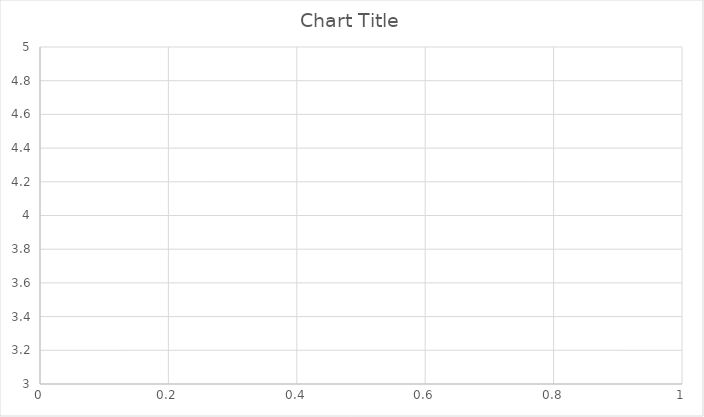
| Category | Series 0 |
|---|---|
| 0 | 3 |
| 1 | 4 |
| 2 | 4 |
| 3 | 3.75 |
| 4 | 3.8 |
| 5 | 3.833 |
| 6 | 3.857 |
| 7 | 3.75 |
| 8 | 3.778 |
| 9 | 3.8 |
| 10 | 3.818 |
| 11 | 3.917 |
| 12 | 4 |
| 13 | 3.929 |
| 14 | 3.933 |
| 15 | 3.875 |
| 16 | 3.941 |
| 17 | 4 |
| 18 | 3.947 |
| 19 | 3.9 |
| 20 | 3.905 |
| 21 | 3.909 |
| 22 | 3.87 |
| 23 | 3.875 |
| 24 | 3.88 |
| 25 | 3.923 |
| 26 | 3.926 |
| 27 | 3.929 |
| 28 | 3.931 |
| 29 | 3.9 |
| 30 | 3.903 |
| 31 | 3.906 |
| 32 | 3.909 |
| 33 | 3.941 |
| 34 | 3.914 |
| 35 | 3.917 |
| 36 | 3.919 |
| 37 | 3.895 |
| 38 | 3.872 |
| 39 | 3.9 |
| 40 | 3.902 |
| 41 | 3.881 |
| 42 | 3.86 |
| 43 | 3.886 |
| 44 | 3.889 |
| 45 | 3.87 |
| 46 | 3.872 |
| 47 | 3.875 |
| 48 | 3.857 |
| 49 | 3.88 |
| 50 | 3.882 |
| 51 | 3.885 |
| 52 | 3.887 |
| 53 | 3.87 |
| 54 | 3.855 |
| 55 | 3.857 |
| 56 | 3.86 |
| 57 | 3.845 |
| 58 | 3.864 |
| 59 | 3.85 |
| 60 | 3.836 |
| 61 | 3.839 |
| 62 | 3.857 |
| 63 | 3.844 |
| 64 | 3.862 |
| 65 | 3.848 |
| 66 | 3.851 |
| 67 | 3.838 |
| 68 | 3.841 |
| 69 | 3.843 |
| 70 | 3.859 |
| 71 | 3.875 |
| 72 | 3.863 |
| 73 | 3.865 |
| 74 | 3.88 |
| 75 | 3.882 |
| 76 | 3.883 |
| 77 | 3.872 |
| 78 | 3.861 |
| 79 | 3.875 |
| 80 | 3.864 |
| 81 | 3.854 |
| 82 | 3.843 |
| 83 | 3.845 |
| 84 | 3.835 |
| 85 | 3.826 |
| 86 | 3.828 |
| 87 | 3.841 |
| 88 | 3.854 |
| 89 | 3.856 |
| 90 | 3.846 |
| 91 | 3.859 |
| 92 | 3.871 |
| 93 | 3.862 |
| 94 | 3.853 |
| 95 | 3.854 |
| 96 | 3.845 |
| 97 | 3.837 |
| 98 | 3.838 |
| 99 | 3.84 |
| 100 | 3.842 |
| 101 | 3.833 |
| 102 | 3.825 |
| 103 | 3.817 |
| 104 | 3.81 |
| 105 | 3.802 |
| 106 | 3.804 |
| 107 | 3.806 |
| 108 | 3.798 |
| 109 | 3.791 |
| 110 | 3.793 |
| 111 | 3.786 |
| 112 | 3.788 |
| 113 | 3.781 |
| 114 | 3.774 |
| 115 | 3.767 |
| 116 | 3.769 |
| 117 | 3.763 |
| 118 | 3.756 |
| 119 | 3.758 |
| 120 | 3.752 |
| 121 | 3.746 |
| 122 | 3.748 |
| 123 | 3.758 |
| 124 | 3.768 |
| 125 | 3.77 |
| 126 | 3.772 |
| 127 | 3.773 |
| 128 | 3.775 |
| 129 | 3.785 |
| 130 | 3.779 |
| 131 | 3.78 |
| 132 | 3.782 |
| 133 | 3.776 |
| 134 | 3.77 |
| 135 | 3.765 |
| 136 | 3.766 |
| 137 | 3.768 |
| 138 | 3.777 |
| 139 | 3.779 |
| 140 | 3.773 |
| 141 | 3.768 |
| 142 | 3.762 |
| 143 | 3.771 |
| 144 | 3.766 |
| 145 | 3.774 |
| 146 | 3.769 |
| 147 | 3.764 |
| 148 | 3.765 |
| 149 | 3.76 |
| 150 | 3.755 |
| 151 | 3.757 |
| 152 | 3.752 |
| 153 | 3.747 |
| 154 | 3.748 |
| 155 | 3.756 |
| 156 | 3.758 |
| 157 | 3.759 |
| 158 | 3.755 |
| 159 | 3.756 |
| 160 | 3.758 |
| 161 | 3.759 |
| 162 | 3.755 |
| 163 | 3.756 |
| 164 | 3.758 |
| 165 | 3.753 |
| 166 | 3.749 |
| 167 | 3.75 |
| 168 | 3.746 |
| 169 | 3.741 |
| 170 | 3.749 |
| 171 | 3.75 |
| 172 | 3.746 |
| 173 | 3.747 |
| 174 | 3.754 |
| 175 | 3.756 |
| 176 | 3.751 |
| 177 | 3.753 |
| 178 | 3.749 |
| 179 | 3.744 |
| 180 | 3.746 |
| 181 | 3.742 |
| 182 | 3.738 |
| 183 | 3.734 |
| 184 | 3.73 |
| 185 | 3.731 |
| 186 | 3.733 |
| 187 | 3.734 |
| 188 | 3.73 |
| 189 | 3.737 |
| 190 | 3.738 |
| 191 | 3.734 |
| 192 | 3.741 |
| 193 | 3.742 |
| 194 | 3.738 |
| 195 | 3.735 |
| 196 | 3.736 |
| 197 | 3.737 |
| 198 | 3.739 |
| 199 | 3.74 |
| 200 | 3.741 |
| 201 | 3.748 |
| 202 | 3.754 |
| 203 | 3.75 |
| 204 | 3.751 |
| 205 | 3.748 |
| 206 | 3.754 |
| 207 | 3.76 |
| 208 | 3.756 |
| 209 | 3.757 |
| 210 | 3.754 |
| 211 | 3.759 |
| 212 | 3.761 |
| 213 | 3.757 |
| 214 | 3.753 |
| 215 | 3.755 |
| 216 | 3.756 |
| 217 | 3.752 |
| 218 | 3.749 |
| 219 | 3.745 |
| 220 | 3.747 |
| 221 | 3.752 |
| 222 | 3.749 |
| 223 | 3.754 |
| 224 | 3.751 |
| 225 | 3.748 |
| 226 | 3.753 |
| 227 | 3.754 |
| 228 | 3.751 |
| 229 | 3.752 |
| 230 | 3.758 |
| 231 | 3.754 |
| 232 | 3.755 |
| 233 | 3.756 |
| 234 | 3.757 |
| 235 | 3.754 |
| 236 | 3.755 |
| 237 | 3.752 |
| 238 | 3.753 |
| 239 | 3.754 |
| 240 | 3.751 |
| 241 | 3.748 |
| 242 | 3.745 |
| 243 | 3.746 |
| 244 | 3.747 |
| 245 | 3.752 |
| 246 | 3.749 |
| 247 | 3.75 |
| 248 | 3.747 |
| 249 | 3.748 |
| 250 | 3.753 |
| 251 | 3.758 |
| 252 | 3.763 |
| 253 | 3.76 |
| 254 | 3.757 |
| 255 | 3.754 |
| 256 | 3.751 |
| 257 | 3.756 |
| 258 | 3.761 |
| 259 | 3.758 |
| 260 | 3.759 |
| 261 | 3.763 |
| 262 | 3.764 |
| 263 | 3.761 |
| 264 | 3.762 |
| 265 | 3.759 |
| 266 | 3.76 |
| 267 | 3.761 |
| 268 | 3.762 |
| 269 | 3.759 |
| 270 | 3.756 |
| 271 | 3.757 |
| 272 | 3.758 |
| 273 | 3.755 |
| 274 | 3.76 |
| 275 | 3.761 |
| 276 | 3.758 |
| 277 | 3.763 |
| 278 | 3.76 |
| 279 | 3.757 |
| 280 | 3.762 |
| 281 | 3.759 |
| 282 | 3.76 |
| 283 | 3.757 |
| 284 | 3.754 |
| 285 | 3.755 |
| 286 | 3.753 |
| 287 | 3.75 |
| 288 | 3.747 |
| 289 | 3.748 |
| 290 | 3.749 |
| 291 | 3.753 |
| 292 | 3.754 |
| 293 | 3.755 |
| 294 | 3.756 |
| 295 | 3.753 |
| 296 | 3.751 |
| 297 | 3.748 |
| 298 | 3.746 |
| 299 | 3.743 |
| 300 | 3.748 |
| 301 | 3.748 |
| 302 | 3.752 |
| 303 | 3.753 |
| 304 | 3.754 |
| 305 | 3.752 |
| 306 | 3.752 |
| 307 | 3.753 |
| 308 | 3.751 |
| 309 | 3.752 |
| 310 | 3.756 |
| 311 | 3.76 |
| 312 | 3.757 |
| 313 | 3.755 |
| 314 | 3.752 |
| 315 | 3.75 |
| 316 | 3.754 |
| 317 | 3.758 |
| 318 | 3.759 |
| 319 | 3.759 |
| 320 | 3.76 |
| 321 | 3.761 |
| 322 | 3.759 |
| 323 | 3.759 |
| 324 | 3.757 |
| 325 | 3.758 |
| 326 | 3.758 |
| 327 | 3.759 |
| 328 | 3.757 |
| 329 | 3.755 |
| 330 | 3.755 |
| 331 | 3.756 |
| 332 | 3.757 |
| 333 | 3.757 |
| 334 | 3.755 |
| 335 | 3.756 |
| 336 | 3.754 |
| 337 | 3.757 |
| 338 | 3.761 |
| 339 | 3.762 |
| 340 | 3.762 |
| 341 | 3.766 |
| 342 | 3.77 |
| 343 | 3.767 |
| 344 | 3.768 |
| 345 | 3.769 |
| 346 | 3.767 |
| 347 | 3.764 |
| 348 | 3.765 |
| 349 | 3.766 |
| 350 | 3.766 |
| 351 | 3.764 |
| 352 | 3.762 |
| 353 | 3.76 |
| 354 | 3.761 |
| 355 | 3.761 |
| 356 | 3.759 |
| 357 | 3.763 |
| 358 | 3.76 |
| 359 | 3.764 |
| 360 | 3.765 |
| 361 | 3.762 |
| 362 | 3.76 |
| 363 | 3.764 |
| 364 | 3.764 |
| 365 | 3.762 |
| 366 | 3.763 |
| 367 | 3.764 |
| 368 | 3.767 |
| 369 | 3.765 |
| 370 | 3.765 |
| 371 | 3.763 |
| 372 | 3.761 |
| 373 | 3.762 |
| 374 | 3.765 |
| 375 | 3.763 |
| 376 | 3.764 |
| 377 | 3.765 |
| 378 | 3.763 |
| 379 | 3.766 |
| 380 | 3.766 |
| 381 | 3.77 |
| 382 | 3.768 |
| 383 | 3.768 |
| 384 | 3.771 |
| 385 | 3.772 |
| 386 | 3.77 |
| 387 | 3.768 |
| 388 | 3.769 |
| 389 | 3.767 |
| 390 | 3.767 |
| 391 | 3.77 |
| 392 | 3.774 |
| 393 | 3.772 |
| 394 | 3.77 |
| 395 | 3.768 |
| 396 | 3.766 |
| 397 | 3.766 |
| 398 | 3.767 |
| 399 | 3.768 |
| 400 | 3.766 |
| 401 | 3.766 |
| 402 | 3.767 |
| 403 | 3.765 |
| 404 | 3.768 |
| 405 | 3.766 |
| 406 | 3.769 |
| 407 | 3.77 |
| 408 | 3.773 |
| 409 | 3.776 |
| 410 | 3.774 |
| 411 | 3.774 |
| 412 | 3.775 |
| 413 | 3.775 |
| 414 | 3.776 |
| 415 | 3.774 |
| 416 | 3.772 |
| 417 | 3.773 |
| 418 | 3.776 |
| 419 | 3.779 |
| 420 | 3.781 |
| 421 | 3.78 |
| 422 | 3.778 |
| 423 | 3.781 |
| 424 | 3.779 |
| 425 | 3.777 |
| 426 | 3.775 |
| 427 | 3.778 |
| 428 | 3.776 |
| 429 | 3.777 |
| 430 | 3.78 |
| 431 | 3.778 |
| 432 | 3.778 |
| 433 | 3.781 |
| 434 | 3.782 |
| 435 | 3.782 |
| 436 | 3.785 |
| 437 | 3.783 |
| 438 | 3.781 |
| 439 | 3.78 |
| 440 | 3.78 |
| 441 | 3.778 |
| 442 | 3.779 |
| 443 | 3.777 |
| 444 | 3.775 |
| 445 | 3.776 |
| 446 | 3.776 |
| 447 | 3.775 |
| 448 | 3.775 |
| 449 | 3.773 |
| 450 | 3.774 |
| 451 | 3.774 |
| 452 | 3.773 |
| 453 | 3.775 |
| 454 | 3.776 |
| 455 | 3.776 |
| 456 | 3.775 |
| 457 | 3.773 |
| 458 | 3.776 |
| 459 | 3.774 |
| 460 | 3.772 |
| 461 | 3.773 |
| 462 | 3.771 |
| 463 | 3.772 |
| 464 | 3.772 |
| 465 | 3.773 |
| 466 | 3.775 |
| 467 | 3.776 |
| 468 | 3.776 |
| 469 | 3.777 |
| 470 | 3.775 |
| 471 | 3.773 |
| 472 | 3.772 |
| 473 | 3.77 |
| 474 | 3.771 |
| 475 | 3.771 |
| 476 | 3.769 |
| 477 | 3.768 |
| 478 | 3.768 |
| 479 | 3.767 |
| 480 | 3.765 |
| 481 | 3.766 |
| 482 | 3.764 |
| 483 | 3.762 |
| 484 | 3.763 |
| 485 | 3.761 |
| 486 | 3.762 |
| 487 | 3.764 |
| 488 | 3.765 |
| 489 | 3.767 |
| 490 | 3.77 |
| 491 | 3.768 |
| 492 | 3.771 |
| 493 | 3.769 |
| 494 | 3.768 |
| 495 | 3.768 |
| 496 | 3.771 |
| 497 | 3.769 |
| 498 | 3.77 |
| 499 | 3.772 |
| 500 | 3.77 |
| 501 | 3.771 |
| 502 | 3.773 |
| 503 | 3.772 |
| 504 | 3.772 |
| 505 | 3.773 |
| 506 | 3.771 |
| 507 | 3.77 |
| 508 | 3.768 |
| 509 | 3.769 |
| 510 | 3.767 |
| 511 | 3.768 |
| 512 | 3.766 |
| 513 | 3.765 |
| 514 | 3.765 |
| 515 | 3.766 |
| 516 | 3.768 |
| 517 | 3.768 |
| 518 | 3.767 |
| 519 | 3.765 |
| 520 | 3.766 |
| 521 | 3.764 |
| 522 | 3.765 |
| 523 | 3.763 |
| 524 | 3.766 |
| 525 | 3.764 |
| 526 | 3.765 |
| 527 | 3.765 |
| 528 | 3.766 |
| 529 | 3.764 |
| 530 | 3.763 |
| 531 | 3.765 |
| 532 | 3.767 |
| 533 | 3.768 |
| 534 | 3.766 |
| 535 | 3.767 |
| 536 | 3.767 |
| 537 | 3.766 |
| 538 | 3.766 |
| 539 | 3.769 |
| 540 | 3.767 |
| 541 | 3.768 |
| 542 | 3.768 |
| 543 | 3.77 |
| 544 | 3.771 |
| 545 | 3.771 |
| 546 | 3.771 |
| 547 | 3.774 |
| 548 | 3.776 |
| 549 | 3.776 |
| 550 | 3.777 |
| 551 | 3.775 |
| 552 | 3.774 |
| 553 | 3.774 |
| 554 | 3.773 |
| 555 | 3.773 |
| 556 | 3.774 |
| 557 | 3.772 |
| 558 | 3.773 |
| 559 | 3.775 |
| 560 | 3.775 |
| 561 | 3.774 |
| 562 | 3.773 |
| 563 | 3.775 |
| 564 | 3.773 |
| 565 | 3.774 |
| 566 | 3.774 |
| 567 | 3.773 |
| 568 | 3.772 |
| 569 | 3.77 |
| 570 | 3.771 |
| 571 | 3.773 |
| 572 | 3.773 |
| 573 | 3.772 |
| 574 | 3.774 |
| 575 | 3.776 |
| 576 | 3.776 |
| 577 | 3.775 |
| 578 | 3.774 |
| 579 | 3.772 |
| 580 | 3.771 |
| 581 | 3.77 |
| 582 | 3.77 |
| 583 | 3.771 |
| 584 | 3.769 |
| 585 | 3.77 |
| 586 | 3.772 |
| 587 | 3.77 |
| 588 | 3.772 |
| 589 | 3.771 |
| 590 | 3.772 |
| 591 | 3.774 |
| 592 | 3.774 |
| 593 | 3.774 |
| 594 | 3.775 |
| 595 | 3.775 |
| 596 | 3.774 |
| 597 | 3.773 |
| 598 | 3.773 |
| 599 | 3.772 |
| 600 | 3.77 |
| 601 | 3.771 |
| 602 | 3.769 |
| 603 | 3.772 |
| 604 | 3.772 |
| 605 | 3.772 |
| 606 | 3.773 |
| 607 | 3.771 |
| 608 | 3.772 |
| 609 | 3.77 |
| 610 | 3.771 |
| 611 | 3.77 |
| 612 | 3.768 |
| 613 | 3.77 |
| 614 | 3.772 |
| 615 | 3.773 |
| 616 | 3.775 |
| 617 | 3.775 |
| 618 | 3.775 |
| 619 | 3.777 |
| 620 | 3.778 |
| 621 | 3.777 |
| 622 | 3.777 |
| 623 | 3.776 |
| 624 | 3.774 |
| 625 | 3.776 |
| 626 | 3.775 |
| 627 | 3.775 |
| 628 | 3.776 |
| 629 | 3.776 |
| 630 | 3.777 |
| 631 | 3.775 |
| 632 | 3.776 |
| 633 | 3.778 |
| 634 | 3.78 |
| 635 | 3.781 |
| 636 | 3.782 |
| 637 | 3.781 |
| 638 | 3.779 |
| 639 | 3.781 |
| 640 | 3.78 |
| 641 | 3.78 |
| 642 | 3.781 |
| 643 | 3.78 |
| 644 | 3.78 |
| 645 | 3.779 |
| 646 | 3.779 |
| 647 | 3.779 |
| 648 | 3.781 |
| 649 | 3.78 |
| 650 | 3.782 |
| 651 | 3.784 |
| 652 | 3.783 |
| 653 | 3.784 |
| 654 | 3.785 |
| 655 | 3.784 |
| 656 | 3.785 |
| 657 | 3.786 |
| 658 | 3.785 |
| 659 | 3.783 |
| 660 | 3.782 |
| 661 | 3.781 |
| 662 | 3.781 |
| 663 | 3.783 |
| 664 | 3.783 |
| 665 | 3.785 |
| 666 | 3.787 |
| 667 | 3.786 |
| 668 | 3.786 |
| 669 | 3.785 |
| 670 | 3.784 |
| 671 | 3.783 |
| 672 | 3.783 |
| 673 | 3.785 |
| 674 | 3.784 |
| 675 | 3.783 |
| 676 | 3.783 |
| 677 | 3.785 |
| 678 | 3.785 |
| 679 | 3.784 |
| 680 | 3.784 |
| 681 | 3.783 |
| 682 | 3.783 |
| 683 | 3.785 |
| 684 | 3.784 |
| 685 | 3.784 |
| 686 | 3.783 |
| 687 | 3.782 |
| 688 | 3.782 |
| 689 | 3.781 |
| 690 | 3.781 |
| 691 | 3.782 |
| 692 | 3.781 |
| 693 | 3.78 |
| 694 | 3.78 |
| 695 | 3.779 |
| 696 | 3.779 |
| 697 | 3.778 |
| 698 | 3.78 |
| 699 | 3.779 |
| 700 | 3.777 |
| 701 | 3.778 |
| 702 | 3.777 |
| 703 | 3.777 |
| 704 | 3.777 |
| 705 | 3.778 |
| 706 | 3.778 |
| 707 | 3.778 |
| 708 | 3.779 |
| 709 | 3.777 |
| 710 | 3.778 |
| 711 | 3.777 |
| 712 | 3.777 |
| 713 | 3.777 |
| 714 | 3.776 |
| 715 | 3.777 |
| 716 | 3.775 |
| 717 | 3.776 |
| 718 | 3.776 |
| 719 | 3.776 |
| 720 | 3.775 |
| 721 | 3.774 |
| 722 | 3.773 |
| 723 | 3.772 |
| 724 | 3.772 |
| 725 | 3.771 |
| 726 | 3.772 |
| 727 | 3.771 |
| 728 | 3.77 |
| 729 | 3.771 |
| 730 | 3.77 |
| 731 | 3.77 |
| 732 | 3.771 |
| 733 | 3.771 |
| 734 | 3.77 |
| 735 | 3.769 |
| 736 | 3.769 |
| 737 | 3.768 |
| 738 | 3.769 |
| 739 | 3.768 |
| 740 | 3.769 |
| 741 | 3.768 |
| 742 | 3.767 |
| 743 | 3.766 |
| 744 | 3.768 |
| 745 | 3.767 |
| 746 | 3.766 |
| 747 | 3.767 |
| 748 | 3.766 |
| 749 | 3.768 |
| 750 | 3.768 |
| 751 | 3.77 |
| 752 | 3.77 |
| 753 | 3.769 |
| 754 | 3.77 |
| 755 | 3.771 |
| 756 | 3.771 |
| 757 | 3.773 |
| 758 | 3.772 |
| 759 | 3.774 |
| 760 | 3.774 |
| 761 | 3.776 |
| 762 | 3.775 |
| 763 | 3.774 |
| 764 | 3.773 |
| 765 | 3.772 |
| 766 | 3.771 |
| 767 | 3.77 |
| 768 | 3.769 |
| 769 | 3.769 |
| 770 | 3.77 |
| 771 | 3.769 |
| 772 | 3.77 |
| 773 | 3.77 |
| 774 | 3.769 |
| 775 | 3.768 |
| 776 | 3.768 |
| 777 | 3.77 |
| 778 | 3.77 |
| 779 | 3.772 |
| 780 | 3.772 |
| 781 | 3.774 |
| 782 | 3.773 |
| 783 | 3.773 |
| 784 | 3.775 |
| 785 | 3.776 |
| 786 | 3.778 |
| 787 | 3.778 |
| 788 | 3.778 |
| 789 | 3.778 |
| 790 | 3.779 |
| 791 | 3.779 |
| 792 | 3.781 |
| 793 | 3.781 |
| 794 | 3.781 |
| 795 | 3.783 |
| 796 | 3.782 |
| 797 | 3.783 |
| 798 | 3.785 |
| 799 | 3.784 |
| 800 | 3.783 |
| 801 | 3.783 |
| 802 | 3.782 |
| 803 | 3.782 |
| 804 | 3.781 |
| 805 | 3.782 |
| 806 | 3.781 |
| 807 | 3.781 |
| 808 | 3.781 |
| 809 | 3.781 |
| 810 | 3.781 |
| 811 | 3.78 |
| 812 | 3.78 |
| 813 | 3.779 |
| 814 | 3.779 |
| 815 | 3.778 |
| 816 | 3.778 |
| 817 | 3.778 |
| 818 | 3.778 |
| 819 | 3.778 |
| 820 | 3.778 |
| 821 | 3.777 |
| 822 | 3.776 |
| 823 | 3.775 |
| 824 | 3.776 |
| 825 | 3.776 |
| 826 | 3.775 |
| 827 | 3.774 |
| 828 | 3.776 |
| 829 | 3.775 |
| 830 | 3.774 |
| 831 | 3.773 |
| 832 | 3.772 |
| 833 | 3.771 |
| 834 | 3.771 |
| 835 | 3.772 |
| 836 | 3.772 |
| 837 | 3.772 |
| 838 | 3.771 |
| 839 | 3.771 |
| 840 | 3.772 |
| 841 | 3.772 |
| 842 | 3.771 |
| 843 | 3.77 |
| 844 | 3.769 |
| 845 | 3.771 |
| 846 | 3.77 |
| 847 | 3.771 |
| 848 | 3.771 |
| 849 | 3.772 |
| 850 | 3.771 |
| 851 | 3.771 |
| 852 | 3.77 |
| 853 | 3.77 |
| 854 | 3.77 |
| 855 | 3.77 |
| 856 | 3.769 |
| 857 | 3.769 |
| 858 | 3.768 |
| 859 | 3.769 |
| 860 | 3.77 |
| 861 | 3.769 |
| 862 | 3.768 |
| 863 | 3.769 |
| 864 | 3.769 |
| 865 | 3.768 |
| 866 | 3.767 |
| 867 | 3.766 |
| 868 | 3.768 |
| 869 | 3.768 |
| 870 | 3.769 |
| 871 | 3.771 |
| 872 | 3.77 |
| 873 | 3.771 |
| 874 | 3.771 |
| 875 | 3.771 |
| 876 | 3.77 |
| 877 | 3.77 |
| 878 | 3.77 |
| 879 | 3.77 |
| 880 | 3.771 |
| 881 | 3.771 |
| 882 | 3.772 |
| 883 | 3.773 |
| 884 | 3.773 |
| 885 | 3.773 |
| 886 | 3.772 |
| 887 | 3.773 |
| 888 | 3.774 |
| 889 | 3.773 |
| 890 | 3.772 |
| 891 | 3.771 |
| 892 | 3.772 |
| 893 | 3.772 |
| 894 | 3.772 |
| 895 | 3.772 |
| 896 | 3.773 |
| 897 | 3.774 |
| 898 | 3.774 |
| 899 | 3.773 |
| 900 | 3.772 |
| 901 | 3.773 |
| 902 | 3.772 |
| 903 | 3.772 |
| 904 | 3.772 |
| 905 | 3.773 |
| 906 | 3.773 |
| 907 | 3.773 |
| 908 | 3.772 |
| 909 | 3.771 |
| 910 | 3.773 |
| 911 | 3.772 |
| 912 | 3.771 |
| 913 | 3.771 |
| 914 | 3.772 |
| 915 | 3.771 |
| 916 | 3.772 |
| 917 | 3.772 |
| 918 | 3.773 |
| 919 | 3.773 |
| 920 | 3.772 |
| 921 | 3.772 |
| 922 | 3.772 |
| 923 | 3.772 |
| 924 | 3.772 |
| 925 | 3.771 |
| 926 | 3.77 |
| 927 | 3.772 |
| 928 | 3.772 |
| 929 | 3.771 |
| 930 | 3.77 |
| 931 | 3.77 |
| 932 | 3.77 |
| 933 | 3.769 |
| 934 | 3.77 |
| 935 | 3.771 |
| 936 | 3.771 |
| 937 | 3.771 |
| 938 | 3.772 |
| 939 | 3.771 |
| 940 | 3.772 |
| 941 | 3.772 |
| 942 | 3.772 |
| 943 | 3.771 |
| 944 | 3.771 |
| 945 | 3.772 |
| 946 | 3.771 |
| 947 | 3.77 |
| 948 | 3.769 |
| 949 | 3.769 |
| 950 | 3.769 |
| 951 | 3.768 |
| 952 | 3.769 |
| 953 | 3.768 |
| 954 | 3.768 |
| 955 | 3.767 |
| 956 | 3.766 |
| 957 | 3.766 |
| 958 | 3.766 |
| 959 | 3.766 |
| 960 | 3.766 |
| 961 | 3.766 |
| 962 | 3.767 |
| 963 | 3.769 |
| 964 | 3.768 |
| 965 | 3.768 |
| 966 | 3.769 |
| 967 | 3.771 |
| 968 | 3.771 |
| 969 | 3.771 |
| 970 | 3.772 |
| 971 | 3.772 |
| 972 | 3.772 |
| 973 | 3.773 |
| 974 | 3.772 |
| 975 | 3.772 |
| 976 | 3.772 |
| 977 | 3.772 |
| 978 | 3.772 |
| 979 | 3.773 |
| 980 | 3.775 |
| 981 | 3.775 |
| 982 | 3.776 |
| 983 | 3.777 |
| 984 | 3.779 |
| 985 | 3.779 |
| 986 | 3.779 |
| 987 | 3.778 |
| 988 | 3.778 |
| 989 | 3.779 |
| 990 | 3.78 |
| 991 | 3.781 |
| 992 | 3.78 |
| 993 | 3.78 |
| 994 | 3.781 |
| 995 | 3.78 |
| 996 | 3.779 |
| 997 | 3.78 |
| 998 | 3.78 |
| 999 | 3.781 |
| 1000 | 3.78 |
| 1001 | 3.78 |
| 1002 | 3.78 |
| 1003 | 3.78 |
| 1004 | 3.78 |
| 1005 | 3.78 |
| 1006 | 3.782 |
| 1007 | 3.781 |
| 1008 | 3.781 |
| 1009 | 3.782 |
| 1010 | 3.783 |
| 1011 | 3.784 |
| 1012 | 3.784 |
| 1013 | 3.784 |
| 1014 | 3.783 |
| 1015 | 3.784 |
| 1016 | 3.784 |
| 1017 | 3.783 |
| 1018 | 3.783 |
| 1019 | 3.784 |
| 1020 | 3.785 |
| 1021 | 3.784 |
| 1022 | 3.783 |
| 1023 | 3.782 |
| 1024 | 3.782 |
| 1025 | 3.782 |
| 1026 | 3.782 |
| 1027 | 3.782 |
| 1028 | 3.781 |
| 1029 | 3.782 |
| 1030 | 3.782 |
| 1031 | 3.781 |
| 1032 | 3.782 |
| 1033 | 3.782 |
| 1034 | 3.783 |
| 1035 | 3.783 |
| 1036 | 3.782 |
| 1037 | 3.783 |
| 1038 | 3.784 |
| 1039 | 3.785 |
| 1040 | 3.785 |
| 1041 | 3.784 |
| 1042 | 3.784 |
| 1043 | 3.784 |
| 1044 | 3.784 |
| 1045 | 3.785 |
| 1046 | 3.784 |
| 1047 | 3.785 |
| 1048 | 3.786 |
| 1049 | 3.787 |
| 1050 | 3.787 |
| 1051 | 3.787 |
| 1052 | 3.787 |
| 1053 | 3.788 |
| 1054 | 3.79 |
| 1055 | 3.79 |
| 1056 | 3.789 |
| 1057 | 3.789 |
| 1058 | 3.79 |
| 1059 | 3.79 |
| 1060 | 3.79 |
| 1061 | 3.789 |
| 1062 | 3.788 |
| 1063 | 3.788 |
| 1064 | 3.788 |
| 1065 | 3.787 |
| 1066 | 3.787 |
| 1067 | 3.787 |
| 1068 | 3.787 |
| 1069 | 3.787 |
| 1070 | 3.787 |
| 1071 | 3.788 |
| 1072 | 3.788 |
| 1073 | 3.787 |
| 1074 | 3.788 |
| 1075 | 3.789 |
| 1076 | 3.79 |
| 1077 | 3.79 |
| 1078 | 3.79 |
| 1079 | 3.789 |
| 1080 | 3.789 |
| 1081 | 3.79 |
| 1082 | 3.791 |
| 1083 | 3.791 |
| 1084 | 3.79 |
| 1085 | 3.79 |
| 1086 | 3.789 |
| 1087 | 3.789 |
| 1088 | 3.79 |
| 1089 | 3.789 |
| 1090 | 3.788 |
| 1091 | 3.788 |
| 1092 | 3.789 |
| 1093 | 3.789 |
| 1094 | 3.79 |
| 1095 | 3.791 |
| 1096 | 3.792 |
| 1097 | 3.793 |
| 1098 | 3.793 |
| 1099 | 3.792 |
| 1100 | 3.791 |
| 1101 | 3.791 |
| 1102 | 3.791 |
| 1103 | 3.792 |
| 1104 | 3.792 |
| 1105 | 3.792 |
| 1106 | 3.793 |
| 1107 | 3.793 |
| 1108 | 3.794 |
| 1109 | 3.793 |
| 1110 | 3.794 |
| 1111 | 3.794 |
| 1112 | 3.795 |
| 1113 | 3.794 |
| 1114 | 3.794 |
| 1115 | 3.793 |
| 1116 | 3.793 |
| 1117 | 3.794 |
| 1118 | 3.795 |
| 1119 | 3.796 |
| 1120 | 3.796 |
| 1121 | 3.796 |
| 1122 | 3.796 |
| 1123 | 3.796 |
| 1124 | 3.796 |
| 1125 | 3.796 |
| 1126 | 3.796 |
| 1127 | 3.796 |
| 1128 | 3.796 |
| 1129 | 3.796 |
| 1130 | 3.796 |
| 1131 | 3.795 |
| 1132 | 3.795 |
| 1133 | 3.795 |
| 1134 | 3.796 |
| 1135 | 3.795 |
| 1136 | 3.794 |
| 1137 | 3.794 |
| 1138 | 3.795 |
| 1139 | 3.795 |
| 1140 | 3.794 |
| 1141 | 3.794 |
| 1142 | 3.795 |
| 1143 | 3.795 |
| 1144 | 3.797 |
| 1145 | 3.797 |
| 1146 | 3.797 |
| 1147 | 3.796 |
| 1148 | 3.795 |
| 1149 | 3.795 |
| 1150 | 3.795 |
| 1151 | 3.796 |
| 1152 | 3.795 |
| 1153 | 3.795 |
| 1154 | 3.795 |
| 1155 | 3.795 |
| 1156 | 3.796 |
| 1157 | 3.795 |
| 1158 | 3.796 |
| 1159 | 3.796 |
| 1160 | 3.795 |
| 1161 | 3.795 |
| 1162 | 3.794 |
| 1163 | 3.794 |
| 1164 | 3.795 |
| 1165 | 3.795 |
| 1166 | 3.796 |
| 1167 | 3.797 |
| 1168 | 3.796 |
| 1169 | 3.796 |
| 1170 | 3.795 |
| 1171 | 3.794 |
| 1172 | 3.795 |
| 1173 | 3.796 |
| 1174 | 3.796 |
| 1175 | 3.796 |
| 1176 | 3.795 |
| 1177 | 3.795 |
| 1178 | 3.795 |
| 1179 | 3.794 |
| 1180 | 3.793 |
| 1181 | 3.794 |
| 1182 | 3.794 |
| 1183 | 3.794 |
| 1184 | 3.794 |
| 1185 | 3.793 |
| 1186 | 3.794 |
| 1187 | 3.795 |
| 1188 | 3.794 |
| 1189 | 3.795 |
| 1190 | 3.795 |
| 1191 | 3.794 |
| 1192 | 3.795 |
| 1193 | 3.796 |
| 1194 | 3.797 |
| 1195 | 3.797 |
| 1196 | 3.797 |
| 1197 | 3.796 |
| 1198 | 3.796 |
| 1199 | 3.795 |
| 1200 | 3.794 |
| 1201 | 3.794 |
| 1202 | 3.794 |
| 1203 | 3.793 |
| 1204 | 3.794 |
| 1205 | 3.794 |
| 1206 | 3.794 |
| 1207 | 3.793 |
| 1208 | 3.792 |
| 1209 | 3.792 |
| 1210 | 3.793 |
| 1211 | 3.793 |
| 1212 | 3.793 |
| 1213 | 3.792 |
| 1214 | 3.793 |
| 1215 | 3.793 |
| 1216 | 3.792 |
| 1217 | 3.793 |
| 1218 | 3.793 |
| 1219 | 3.793 |
| 1220 | 3.793 |
| 1221 | 3.794 |
| 1222 | 3.793 |
| 1223 | 3.792 |
| 1224 | 3.792 |
| 1225 | 3.793 |
| 1226 | 3.792 |
| 1227 | 3.793 |
| 1228 | 3.793 |
| 1229 | 3.793 |
| 1230 | 3.793 |
| 1231 | 3.794 |
| 1232 | 3.793 |
| 1233 | 3.793 |
| 1234 | 3.793 |
| 1235 | 3.792 |
| 1236 | 3.793 |
| 1237 | 3.794 |
| 1238 | 3.794 |
| 1239 | 3.794 |
| 1240 | 3.795 |
| 1241 | 3.794 |
| 1242 | 3.795 |
| 1243 | 3.795 |
| 1244 | 3.795 |
| 1245 | 3.795 |
| 1246 | 3.794 |
| 1247 | 3.793 |
| 1248 | 3.794 |
| 1249 | 3.794 |
| 1250 | 3.793 |
| 1251 | 3.793 |
| 1252 | 3.793 |
| 1253 | 3.793 |
| 1254 | 3.793 |
| 1255 | 3.792 |
| 1256 | 3.792 |
| 1257 | 3.792 |
| 1258 | 3.793 |
| 1259 | 3.792 |
| 1260 | 3.791 |
| 1261 | 3.792 |
| 1262 | 3.792 |
| 1263 | 3.791 |
| 1264 | 3.791 |
| 1265 | 3.79 |
| 1266 | 3.789 |
| 1267 | 3.79 |
| 1268 | 3.79 |
| 1269 | 3.79 |
| 1270 | 3.789 |
| 1271 | 3.79 |
| 1272 | 3.79 |
| 1273 | 3.79 |
| 1274 | 3.79 |
| 1275 | 3.79 |
| 1276 | 3.79 |
| 1277 | 3.79 |
| 1278 | 3.79 |
| 1279 | 3.789 |
| 1280 | 3.789 |
| 1281 | 3.789 |
| 1282 | 3.79 |
| 1283 | 3.79 |
| 1284 | 3.79 |
| 1285 | 3.789 |
| 1286 | 3.789 |
| 1287 | 3.79 |
| 1288 | 3.791 |
| 1289 | 3.791 |
| 1290 | 3.79 |
| 1291 | 3.791 |
| 1292 | 3.792 |
| 1293 | 3.793 |
| 1294 | 3.794 |
| 1295 | 3.794 |
| 1296 | 3.794 |
| 1297 | 3.794 |
| 1298 | 3.794 |
| 1299 | 3.794 |
| 1300 | 3.795 |
| 1301 | 3.794 |
| 1302 | 3.794 |
| 1303 | 3.793 |
| 1304 | 3.793 |
| 1305 | 3.792 |
| 1306 | 3.792 |
| 1307 | 3.791 |
| 1308 | 3.791 |
| 1309 | 3.792 |
| 1310 | 3.792 |
| 1311 | 3.792 |
| 1312 | 3.791 |
| 1313 | 3.791 |
| 1314 | 3.791 |
| 1315 | 3.792 |
| 1316 | 3.791 |
| 1317 | 3.791 |
| 1318 | 3.792 |
| 1319 | 3.792 |
| 1320 | 3.793 |
| 1321 | 3.794 |
| 1322 | 3.794 |
| 1323 | 3.793 |
| 1324 | 3.793 |
| 1325 | 3.793 |
| 1326 | 3.794 |
| 1327 | 3.794 |
| 1328 | 3.793 |
| 1329 | 3.792 |
| 1330 | 3.792 |
| 1331 | 3.793 |
| 1332 | 3.793 |
| 1333 | 3.793 |
| 1334 | 3.793 |
| 1335 | 3.794 |
| 1336 | 3.794 |
| 1337 | 3.794 |
| 1338 | 3.793 |
| 1339 | 3.794 |
| 1340 | 3.794 |
| 1341 | 3.794 |
| 1342 | 3.794 |
| 1343 | 3.795 |
| 1344 | 3.794 |
| 1345 | 3.794 |
| 1346 | 3.795 |
| 1347 | 3.795 |
| 1348 | 3.794 |
| 1349 | 3.795 |
| 1350 | 3.794 |
| 1351 | 3.794 |
| 1352 | 3.793 |
| 1353 | 3.793 |
| 1354 | 3.793 |
| 1355 | 3.794 |
| 1356 | 3.794 |
| 1357 | 3.795 |
| 1358 | 3.795 |
| 1359 | 3.796 |
| 1360 | 3.796 |
| 1361 | 3.797 |
| 1362 | 3.797 |
| 1363 | 3.797 |
| 1364 | 3.796 |
| 1365 | 3.797 |
| 1366 | 3.797 |
| 1367 | 3.797 |
| 1368 | 3.797 |
| 1369 | 3.796 |
| 1370 | 3.796 |
| 1371 | 3.795 |
| 1372 | 3.796 |
| 1373 | 3.797 |
| 1374 | 3.797 |
| 1375 | 3.797 |
| 1376 | 3.797 |
| 1377 | 3.796 |
| 1378 | 3.796 |
| 1379 | 3.796 |
| 1380 | 3.796 |
| 1381 | 3.795 |
| 1382 | 3.795 |
| 1383 | 3.794 |
| 1384 | 3.795 |
| 1385 | 3.796 |
| 1386 | 3.795 |
| 1387 | 3.795 |
| 1388 | 3.796 |
| 1389 | 3.796 |
| 1390 | 3.796 |
| 1391 | 3.796 |
| 1392 | 3.797 |
| 1393 | 3.796 |
| 1394 | 3.796 |
| 1395 | 3.796 |
| 1396 | 3.796 |
| 1397 | 3.796 |
| 1398 | 3.796 |
| 1399 | 3.796 |
| 1400 | 3.797 |
| 1401 | 3.797 |
| 1402 | 3.796 |
| 1403 | 3.796 |
| 1404 | 3.797 |
| 1405 | 3.798 |
| 1406 | 3.797 |
| 1407 | 3.797 |
| 1408 | 3.798 |
| 1409 | 3.797 |
| 1410 | 3.797 |
| 1411 | 3.797 |
| 1412 | 3.797 |
| 1413 | 3.797 |
| 1414 | 3.797 |
| 1415 | 3.797 |
| 1416 | 3.797 |
| 1417 | 3.797 |
| 1418 | 3.797 |
| 1419 | 3.798 |
| 1420 | 3.798 |
| 1421 | 3.798 |
| 1422 | 3.799 |
| 1423 | 3.799 |
| 1424 | 3.8 |
| 1425 | 3.801 |
| 1426 | 3.801 |
| 1427 | 3.801 |
| 1428 | 3.801 |
| 1429 | 3.801 |
| 1430 | 3.802 |
| 1431 | 3.802 |
| 1432 | 3.802 |
| 1433 | 3.803 |
| 1434 | 3.803 |
| 1435 | 3.804 |
| 1436 | 3.803 |
| 1437 | 3.804 |
| 1438 | 3.803 |
| 1439 | 3.803 |
| 1440 | 3.802 |
| 1441 | 3.802 |
| 1442 | 3.802 |
| 1443 | 3.802 |
| 1444 | 3.801 |
| 1445 | 3.801 |
| 1446 | 3.801 |
| 1447 | 3.8 |
| 1448 | 3.801 |
| 1449 | 3.801 |
| 1450 | 3.801 |
| 1451 | 3.801 |
| 1452 | 3.801 |
| 1453 | 3.801 |
| 1454 | 3.801 |
| 1455 | 3.8 |
| 1456 | 3.8 |
| 1457 | 3.8 |
| 1458 | 3.8 |
| 1459 | 3.801 |
| 1460 | 3.802 |
| 1461 | 3.801 |
| 1462 | 3.801 |
| 1463 | 3.801 |
| 1464 | 3.801 |
| 1465 | 3.802 |
| 1466 | 3.802 |
| 1467 | 3.802 |
| 1468 | 3.803 |
| 1469 | 3.802 |
| 1470 | 3.801 |
| 1471 | 3.801 |
| 1472 | 3.802 |
| 1473 | 3.801 |
| 1474 | 3.801 |
| 1475 | 3.8 |
| 1476 | 3.8 |
| 1477 | 3.8 |
| 1478 | 3.799 |
| 1479 | 3.799 |
| 1480 | 3.799 |
| 1481 | 3.798 |
| 1482 | 3.798 |
| 1483 | 3.797 |
| 1484 | 3.797 |
| 1485 | 3.797 |
| 1486 | 3.796 |
| 1487 | 3.796 |
| 1488 | 3.796 |
| 1489 | 3.796 |
| 1490 | 3.796 |
| 1491 | 3.796 |
| 1492 | 3.797 |
| 1493 | 3.797 |
| 1494 | 3.796 |
| 1495 | 3.795 |
| 1496 | 3.795 |
| 1497 | 3.795 |
| 1498 | 3.795 |
| 1499 | 3.795 |
| 1500 | 3.795 |
| 1501 | 3.794 |
| 1502 | 3.794 |
| 1503 | 3.794 |
| 1504 | 3.794 |
| 1505 | 3.794 |
| 1506 | 3.795 |
| 1507 | 3.795 |
| 1508 | 3.795 |
| 1509 | 3.795 |
| 1510 | 3.794 |
| 1511 | 3.795 |
| 1512 | 3.794 |
| 1513 | 3.794 |
| 1514 | 3.793 |
| 1515 | 3.793 |
| 1516 | 3.792 |
| 1517 | 3.792 |
| 1518 | 3.791 |
| 1519 | 3.791 |
| 1520 | 3.792 |
| 1521 | 3.791 |
| 1522 | 3.791 |
| 1523 | 3.792 |
| 1524 | 3.791 |
| 1525 | 3.792 |
| 1526 | 3.792 |
| 1527 | 3.792 |
| 1528 | 3.792 |
| 1529 | 3.792 |
| 1530 | 3.792 |
| 1531 | 3.792 |
| 1532 | 3.793 |
| 1533 | 3.793 |
| 1534 | 3.793 |
| 1535 | 3.794 |
| 1536 | 3.794 |
| 1537 | 3.794 |
| 1538 | 3.793 |
| 1539 | 3.794 |
| 1540 | 3.793 |
| 1541 | 3.792 |
| 1542 | 3.793 |
| 1543 | 3.793 |
| 1544 | 3.793 |
| 1545 | 3.792 |
| 1546 | 3.793 |
| 1547 | 3.793 |
| 1548 | 3.793 |
| 1549 | 3.794 |
| 1550 | 3.794 |
| 1551 | 3.795 |
| 1552 | 3.796 |
| 1553 | 3.795 |
| 1554 | 3.795 |
| 1555 | 3.795 |
| 1556 | 3.795 |
| 1557 | 3.796 |
| 1558 | 3.796 |
| 1559 | 3.796 |
| 1560 | 3.797 |
| 1561 | 3.798 |
| 1562 | 3.797 |
| 1563 | 3.798 |
| 1564 | 3.797 |
| 1565 | 3.798 |
| 1566 | 3.797 |
| 1567 | 3.797 |
| 1568 | 3.796 |
| 1569 | 3.796 |
| 1570 | 3.796 |
| 1571 | 3.795 |
| 1572 | 3.796 |
| 1573 | 3.797 |
| 1574 | 3.797 |
| 1575 | 3.798 |
| 1576 | 3.797 |
| 1577 | 3.797 |
| 1578 | 3.797 |
| 1579 | 3.797 |
| 1580 | 3.796 |
| 1581 | 3.796 |
| 1582 | 3.796 |
| 1583 | 3.797 |
| 1584 | 3.797 |
| 1585 | 3.796 |
| 1586 | 3.796 |
| 1587 | 3.796 |
| 1588 | 3.795 |
| 1589 | 3.795 |
| 1590 | 3.795 |
| 1591 | 3.795 |
| 1592 | 3.795 |
| 1593 | 3.794 |
| 1594 | 3.794 |
| 1595 | 3.794 |
| 1596 | 3.794 |
| 1597 | 3.794 |
| 1598 | 3.794 |
| 1599 | 3.793 |
| 1600 | 3.793 |
| 1601 | 3.794 |
| 1602 | 3.794 |
| 1603 | 3.794 |
| 1604 | 3.795 |
| 1605 | 3.795 |
| 1606 | 3.795 |
| 1607 | 3.795 |
| 1608 | 3.795 |
| 1609 | 3.794 |
| 1610 | 3.794 |
| 1611 | 3.794 |
| 1612 | 3.794 |
| 1613 | 3.793 |
| 1614 | 3.793 |
| 1615 | 3.793 |
| 1616 | 3.793 |
| 1617 | 3.793 |
| 1618 | 3.793 |
| 1619 | 3.793 |
| 1620 | 3.794 |
| 1621 | 3.794 |
| 1622 | 3.794 |
| 1623 | 3.794 |
| 1624 | 3.794 |
| 1625 | 3.795 |
| 1626 | 3.794 |
| 1627 | 3.794 |
| 1628 | 3.794 |
| 1629 | 3.794 |
| 1630 | 3.794 |
| 1631 | 3.794 |
| 1632 | 3.794 |
| 1633 | 3.794 |
| 1634 | 3.794 |
| 1635 | 3.794 |
| 1636 | 3.794 |
| 1637 | 3.794 |
| 1638 | 3.793 |
| 1639 | 3.793 |
| 1640 | 3.793 |
| 1641 | 3.793 |
| 1642 | 3.792 |
| 1643 | 3.793 |
| 1644 | 3.793 |
| 1645 | 3.793 |
| 1646 | 3.792 |
| 1647 | 3.793 |
| 1648 | 3.793 |
| 1649 | 3.793 |
| 1650 | 3.793 |
| 1651 | 3.792 |
| 1652 | 3.792 |
| 1653 | 3.793 |
| 1654 | 3.793 |
| 1655 | 3.793 |
| 1656 | 3.793 |
| 1657 | 3.793 |
| 1658 | 3.793 |
| 1659 | 3.793 |
| 1660 | 3.793 |
| 1661 | 3.793 |
| 1662 | 3.793 |
| 1663 | 3.793 |
| 1664 | 3.793 |
| 1665 | 3.792 |
| 1666 | 3.792 |
| 1667 | 3.793 |
| 1668 | 3.793 |
| 1669 | 3.792 |
| 1670 | 3.792 |
| 1671 | 3.792 |
| 1672 | 3.793 |
| 1673 | 3.793 |
| 1674 | 3.793 |
| 1675 | 3.792 |
| 1676 | 3.792 |
| 1677 | 3.793 |
| 1678 | 3.792 |
| 1679 | 3.792 |
| 1680 | 3.791 |
| 1681 | 3.791 |
| 1682 | 3.79 |
| 1683 | 3.791 |
| 1684 | 3.791 |
| 1685 | 3.791 |
| 1686 | 3.791 |
| 1687 | 3.79 |
| 1688 | 3.79 |
| 1689 | 3.791 |
| 1690 | 3.792 |
| 1691 | 3.791 |
| 1692 | 3.792 |
| 1693 | 3.792 |
| 1694 | 3.792 |
| 1695 | 3.791 |
| 1696 | 3.791 |
| 1697 | 3.791 |
| 1698 | 3.792 |
| 1699 | 3.792 |
| 1700 | 3.791 |
| 1701 | 3.792 |
| 1702 | 3.792 |
| 1703 | 3.792 |
| 1704 | 3.792 |
| 1705 | 3.792 |
| 1706 | 3.793 |
| 1707 | 3.793 |
| 1708 | 3.792 |
| 1709 | 3.792 |
| 1710 | 3.792 |
| 1711 | 3.791 |
| 1712 | 3.792 |
| 1713 | 3.792 |
| 1714 | 3.792 |
| 1715 | 3.793 |
| 1716 | 3.793 |
| 1717 | 3.793 |
| 1718 | 3.793 |
| 1719 | 3.793 |
| 1720 | 3.793 |
| 1721 | 3.793 |
| 1722 | 3.794 |
| 1723 | 3.795 |
| 1724 | 3.795 |
| 1725 | 3.794 |
| 1726 | 3.794 |
| 1727 | 3.795 |
| 1728 | 3.795 |
| 1729 | 3.794 |
| 1730 | 3.795 |
| 1731 | 3.796 |
| 1732 | 3.795 |
| 1733 | 3.795 |
| 1734 | 3.795 |
| 1735 | 3.794 |
| 1736 | 3.794 |
| 1737 | 3.795 |
| 1738 | 3.795 |
| 1739 | 3.795 |
| 1740 | 3.795 |
| 1741 | 3.795 |
| 1742 | 3.796 |
| 1743 | 3.796 |
| 1744 | 3.796 |
| 1745 | 3.796 |
| 1746 | 3.796 |
| 1747 | 3.796 |
| 1748 | 3.796 |
| 1749 | 3.796 |
| 1750 | 3.796 |
| 1751 | 3.796 |
| 1752 | 3.796 |
| 1753 | 3.796 |
| 1754 | 3.795 |
| 1755 | 3.796 |
| 1756 | 3.797 |
| 1757 | 3.797 |
| 1758 | 3.797 |
| 1759 | 3.797 |
| 1760 | 3.797 |
| 1761 | 3.797 |
| 1762 | 3.798 |
| 1763 | 3.798 |
| 1764 | 3.797 |
| 1765 | 3.797 |
| 1766 | 3.797 |
| 1767 | 3.797 |
| 1768 | 3.797 |
| 1769 | 3.797 |
| 1770 | 3.798 |
| 1771 | 3.797 |
| 1772 | 3.797 |
| 1773 | 3.797 |
| 1774 | 3.797 |
| 1775 | 3.797 |
| 1776 | 3.797 |
| 1777 | 3.798 |
| 1778 | 3.798 |
| 1779 | 3.798 |
| 1780 | 3.797 |
| 1781 | 3.797 |
| 1782 | 3.798 |
| 1783 | 3.798 |
| 1784 | 3.797 |
| 1785 | 3.797 |
| 1786 | 3.797 |
| 1787 | 3.798 |
| 1788 | 3.797 |
| 1789 | 3.797 |
| 1790 | 3.798 |
| 1791 | 3.798 |
| 1792 | 3.798 |
| 1793 | 3.798 |
| 1794 | 3.798 |
| 1795 | 3.797 |
| 1796 | 3.797 |
| 1797 | 3.798 |
| 1798 | 3.797 |
| 1799 | 3.797 |
| 1800 | 3.796 |
| 1801 | 3.796 |
| 1802 | 3.796 |
| 1803 | 3.796 |
| 1804 | 3.796 |
| 1805 | 3.796 |
| 1806 | 3.796 |
| 1807 | 3.796 |
| 1808 | 3.796 |
| 1809 | 3.796 |
| 1810 | 3.795 |
| 1811 | 3.796 |
| 1812 | 3.796 |
| 1813 | 3.795 |
| 1814 | 3.795 |
| 1815 | 3.795 |
| 1816 | 3.795 |
| 1817 | 3.795 |
| 1818 | 3.796 |
| 1819 | 3.797 |
| 1820 | 3.797 |
| 1821 | 3.797 |
| 1822 | 3.797 |
| 1823 | 3.797 |
| 1824 | 3.797 |
| 1825 | 3.797 |
| 1826 | 3.797 |
| 1827 | 3.797 |
| 1828 | 3.797 |
| 1829 | 3.796 |
| 1830 | 3.796 |
| 1831 | 3.796 |
| 1832 | 3.796 |
| 1833 | 3.796 |
| 1834 | 3.796 |
| 1835 | 3.796 |
| 1836 | 3.795 |
| 1837 | 3.795 |
| 1838 | 3.796 |
| 1839 | 3.795 |
| 1840 | 3.795 |
| 1841 | 3.795 |
| 1842 | 3.795 |
| 1843 | 3.795 |
| 1844 | 3.795 |
| 1845 | 3.795 |
| 1846 | 3.794 |
| 1847 | 3.795 |
| 1848 | 3.795 |
| 1849 | 3.795 |
| 1850 | 3.795 |
| 1851 | 3.796 |
| 1852 | 3.796 |
| 1853 | 3.796 |
| 1854 | 3.796 |
| 1855 | 3.796 |
| 1856 | 3.796 |
| 1857 | 3.795 |
| 1858 | 3.795 |
| 1859 | 3.795 |
| 1860 | 3.796 |
| 1861 | 3.795 |
| 1862 | 3.795 |
| 1863 | 3.795 |
| 1864 | 3.795 |
| 1865 | 3.795 |
| 1866 | 3.795 |
| 1867 | 3.794 |
| 1868 | 3.795 |
| 1869 | 3.795 |
| 1870 | 3.795 |
| 1871 | 3.795 |
| 1872 | 3.795 |
| 1873 | 3.796 |
| 1874 | 3.795 |
| 1875 | 3.795 |
| 1876 | 3.795 |
| 1877 | 3.794 |
| 1878 | 3.795 |
| 1879 | 3.795 |
| 1880 | 3.795 |
| 1881 | 3.794 |
| 1882 | 3.794 |
| 1883 | 3.795 |
| 1884 | 3.795 |
| 1885 | 3.794 |
| 1886 | 3.795 |
| 1887 | 3.795 |
| 1888 | 3.796 |
| 1889 | 3.795 |
| 1890 | 3.795 |
| 1891 | 3.795 |
| 1892 | 3.795 |
| 1893 | 3.796 |
| 1894 | 3.795 |
| 1895 | 3.795 |
| 1896 | 3.795 |
| 1897 | 3.796 |
| 1898 | 3.796 |
| 1899 | 3.795 |
| 1900 | 3.795 |
| 1901 | 3.795 |
| 1902 | 3.795 |
| 1903 | 3.796 |
| 1904 | 3.796 |
| 1905 | 3.796 |
| 1906 | 3.795 |
| 1907 | 3.795 |
| 1908 | 3.795 |
| 1909 | 3.794 |
| 1910 | 3.794 |
| 1911 | 3.794 |
| 1912 | 3.795 |
| 1913 | 3.794 |
| 1914 | 3.795 |
| 1915 | 3.794 |
| 1916 | 3.794 |
| 1917 | 3.795 |
| 1918 | 3.794 |
| 1919 | 3.794 |
| 1920 | 3.794 |
| 1921 | 3.794 |
| 1922 | 3.794 |
| 1923 | 3.794 |
| 1924 | 3.794 |
| 1925 | 3.794 |
| 1926 | 3.794 |
| 1927 | 3.795 |
| 1928 | 3.794 |
| 1929 | 3.795 |
| 1930 | 3.794 |
| 1931 | 3.795 |
| 1932 | 3.794 |
| 1933 | 3.794 |
| 1934 | 3.793 |
| 1935 | 3.793 |
| 1936 | 3.793 |
| 1937 | 3.793 |
| 1938 | 3.793 |
| 1939 | 3.792 |
| 1940 | 3.792 |
| 1941 | 3.793 |
| 1942 | 3.793 |
| 1943 | 3.792 |
| 1944 | 3.792 |
| 1945 | 3.791 |
| 1946 | 3.792 |
| 1947 | 3.792 |
| 1948 | 3.792 |
| 1949 | 3.791 |
| 1950 | 3.791 |
| 1951 | 3.791 |
| 1952 | 3.791 |
| 1953 | 3.79 |
| 1954 | 3.791 |
| 1955 | 3.79 |
| 1956 | 3.79 |
| 1957 | 3.791 |
| 1958 | 3.79 |
| 1959 | 3.79 |
| 1960 | 3.791 |
| 1961 | 3.791 |
| 1962 | 3.79 |
| 1963 | 3.79 |
| 1964 | 3.79 |
| 1965 | 3.79 |
| 1966 | 3.79 |
| 1967 | 3.79 |
| 1968 | 3.79 |
| 1969 | 3.791 |
| 1970 | 3.79 |
| 1971 | 3.791 |
| 1972 | 3.791 |
| 1973 | 3.791 |
| 1974 | 3.791 |
| 1975 | 3.791 |
| 1976 | 3.791 |
| 1977 | 3.791 |
| 1978 | 3.792 |
| 1979 | 3.792 |
| 1980 | 3.793 |
| 1981 | 3.793 |
| 1982 | 3.793 |
| 1983 | 3.793 |
| 1984 | 3.794 |
| 1985 | 3.794 |
| 1986 | 3.793 |
| 1987 | 3.794 |
| 1988 | 3.794 |
| 1989 | 3.793 |
| 1990 | 3.793 |
| 1991 | 3.794 |
| 1992 | 3.793 |
| 1993 | 3.793 |
| 1994 | 3.793 |
| 1995 | 3.794 |
| 1996 | 3.794 |
| 1997 | 3.794 |
| 1998 | 3.794 |
| 1999 | 3.794 |
| 2000 | 3.794 |
| 2001 | 3.794 |
| 2002 | 3.794 |
| 2003 | 3.794 |
| 2004 | 3.794 |
| 2005 | 3.794 |
| 2006 | 3.794 |
| 2007 | 3.793 |
| 2008 | 3.793 |
| 2009 | 3.793 |
| 2010 | 3.793 |
| 2011 | 3.793 |
| 2012 | 3.793 |
| 2013 | 3.793 |
| 2014 | 3.793 |
| 2015 | 3.793 |
| 2016 | 3.793 |
| 2017 | 3.793 |
| 2018 | 3.793 |
| 2019 | 3.794 |
| 2020 | 3.793 |
| 2021 | 3.793 |
| 2022 | 3.793 |
| 2023 | 3.792 |
| 2024 | 3.793 |
| 2025 | 3.793 |
| 2026 | 3.793 |
| 2027 | 3.793 |
| 2028 | 3.793 |
| 2029 | 3.792 |
| 2030 | 3.793 |
| 2031 | 3.793 |
| 2032 | 3.793 |
| 2033 | 3.794 |
| 2034 | 3.794 |
| 2035 | 3.794 |
| 2036 | 3.793 |
| 2037 | 3.793 |
| 2038 | 3.793 |
| 2039 | 3.794 |
| 2040 | 3.794 |
| 2041 | 3.794 |
| 2042 | 3.794 |
| 2043 | 3.795 |
| 2044 | 3.795 |
| 2045 | 3.795 |
| 2046 | 3.795 |
| 2047 | 3.795 |
| 2048 | 3.796 |
| 2049 | 3.796 |
| 2050 | 3.795 |
| 2051 | 3.795 |
| 2052 | 3.795 |
| 2053 | 3.795 |
| 2054 | 3.795 |
| 2055 | 3.795 |
| 2056 | 3.794 |
| 2057 | 3.794 |
| 2058 | 3.794 |
| 2059 | 3.794 |
| 2060 | 3.793 |
| 2061 | 3.793 |
| 2062 | 3.793 |
| 2063 | 3.793 |
| 2064 | 3.793 |
| 2065 | 3.793 |
| 2066 | 3.793 |
| 2067 | 3.793 |
| 2068 | 3.793 |
| 2069 | 3.793 |
| 2070 | 3.793 |
| 2071 | 3.793 |
| 2072 | 3.793 |
| 2073 | 3.792 |
| 2074 | 3.793 |
| 2075 | 3.793 |
| 2076 | 3.793 |
| 2077 | 3.793 |
| 2078 | 3.793 |
| 2079 | 3.793 |
| 2080 | 3.792 |
| 2081 | 3.793 |
| 2082 | 3.794 |
| 2083 | 3.793 |
| 2084 | 3.793 |
| 2085 | 3.793 |
| 2086 | 3.793 |
| 2087 | 3.794 |
| 2088 | 3.794 |
| 2089 | 3.793 |
| 2090 | 3.793 |
| 2091 | 3.793 |
| 2092 | 3.793 |
| 2093 | 3.793 |
| 2094 | 3.794 |
| 2095 | 3.794 |
| 2096 | 3.794 |
| 2097 | 3.794 |
| 2098 | 3.794 |
| 2099 | 3.794 |
| 2100 | 3.794 |
| 2101 | 3.794 |
| 2102 | 3.794 |
| 2103 | 3.794 |
| 2104 | 3.794 |
| 2105 | 3.794 |
| 2106 | 3.794 |
| 2107 | 3.795 |
| 2108 | 3.794 |
| 2109 | 3.795 |
| 2110 | 3.794 |
| 2111 | 3.795 |
| 2112 | 3.795 |
| 2113 | 3.794 |
| 2114 | 3.795 |
| 2115 | 3.795 |
| 2116 | 3.796 |
| 2117 | 3.797 |
| 2118 | 3.797 |
| 2119 | 3.797 |
| 2120 | 3.796 |
| 2121 | 3.796 |
| 2122 | 3.796 |
| 2123 | 3.796 |
| 2124 | 3.796 |
| 2125 | 3.795 |
| 2126 | 3.795 |
| 2127 | 3.796 |
| 2128 | 3.796 |
| 2129 | 3.797 |
| 2130 | 3.796 |
| 2131 | 3.797 |
| 2132 | 3.797 |
| 2133 | 3.797 |
| 2134 | 3.797 |
| 2135 | 3.797 |
| 2136 | 3.797 |
| 2137 | 3.797 |
| 2138 | 3.797 |
| 2139 | 3.797 |
| 2140 | 3.797 |
| 2141 | 3.797 |
| 2142 | 3.797 |
| 2143 | 3.797 |
| 2144 | 3.798 |
| 2145 | 3.798 |
| 2146 | 3.798 |
| 2147 | 3.798 |
| 2148 | 3.798 |
| 2149 | 3.798 |
| 2150 | 3.798 |
| 2151 | 3.798 |
| 2152 | 3.798 |
| 2153 | 3.799 |
| 2154 | 3.798 |
| 2155 | 3.799 |
| 2156 | 3.798 |
| 2157 | 3.798 |
| 2158 | 3.799 |
| 2159 | 3.798 |
| 2160 | 3.798 |
| 2161 | 3.798 |
| 2162 | 3.798 |
| 2163 | 3.798 |
| 2164 | 3.798 |
| 2165 | 3.797 |
| 2166 | 3.798 |
| 2167 | 3.798 |
| 2168 | 3.798 |
| 2169 | 3.798 |
| 2170 | 3.798 |
| 2171 | 3.798 |
| 2172 | 3.798 |
| 2173 | 3.799 |
| 2174 | 3.799 |
| 2175 | 3.799 |
| 2176 | 3.799 |
| 2177 | 3.799 |
| 2178 | 3.799 |
| 2179 | 3.8 |
| 2180 | 3.8 |
| 2181 | 3.8 |
| 2182 | 3.8 |
| 2183 | 3.799 |
| 2184 | 3.8 |
| 2185 | 3.8 |
| 2186 | 3.8 |
| 2187 | 3.799 |
| 2188 | 3.799 |
| 2189 | 3.8 |
| 2190 | 3.8 |
| 2191 | 3.8 |
| 2192 | 3.8 |
| 2193 | 3.8 |
| 2194 | 3.8 |
| 2195 | 3.8 |
| 2196 | 3.8 |
| 2197 | 3.8 |
| 2198 | 3.8 |
| 2199 | 3.8 |
| 2200 | 3.8 |
| 2201 | 3.8 |
| 2202 | 3.8 |
| 2203 | 3.8 |
| 2204 | 3.801 |
| 2205 | 3.801 |
| 2206 | 3.801 |
| 2207 | 3.801 |
| 2208 | 3.8 |
| 2209 | 3.801 |
| 2210 | 3.801 |
| 2211 | 3.8 |
| 2212 | 3.8 |
| 2213 | 3.8 |
| 2214 | 3.8 |
| 2215 | 3.8 |
| 2216 | 3.799 |
| 2217 | 3.799 |
| 2218 | 3.799 |
| 2219 | 3.799 |
| 2220 | 3.799 |
| 2221 | 3.799 |
| 2222 | 3.799 |
| 2223 | 3.799 |
| 2224 | 3.799 |
| 2225 | 3.799 |
| 2226 | 3.799 |
| 2227 | 3.798 |
| 2228 | 3.799 |
| 2229 | 3.799 |
| 2230 | 3.799 |
| 2231 | 3.799 |
| 2232 | 3.798 |
| 2233 | 3.798 |
| 2234 | 3.798 |
| 2235 | 3.798 |
| 2236 | 3.797 |
| 2237 | 3.797 |
| 2238 | 3.798 |
| 2239 | 3.798 |
| 2240 | 3.798 |
| 2241 | 3.799 |
| 2242 | 3.798 |
| 2243 | 3.799 |
| 2244 | 3.798 |
| 2245 | 3.798 |
| 2246 | 3.798 |
| 2247 | 3.797 |
| 2248 | 3.798 |
| 2249 | 3.798 |
| 2250 | 3.798 |
| 2251 | 3.798 |
| 2252 | 3.798 |
| 2253 | 3.798 |
| 2254 | 3.798 |
| 2255 | 3.798 |
| 2256 | 3.798 |
| 2257 | 3.798 |
| 2258 | 3.798 |
| 2259 | 3.799 |
| 2260 | 3.799 |
| 2261 | 3.799 |
| 2262 | 3.8 |
| 2263 | 3.8 |
| 2264 | 3.8 |
| 2265 | 3.8 |
| 2266 | 3.8 |
| 2267 | 3.8 |
| 2268 | 3.801 |
| 2269 | 3.801 |
| 2270 | 3.801 |
| 2271 | 3.801 |
| 2272 | 3.801 |
| 2273 | 3.801 |
| 2274 | 3.802 |
| 2275 | 3.801 |
| 2276 | 3.801 |
| 2277 | 3.801 |
| 2278 | 3.802 |
| 2279 | 3.801 |
| 2280 | 3.801 |
| 2281 | 3.801 |
| 2282 | 3.802 |
| 2283 | 3.802 |
| 2284 | 3.801 |
| 2285 | 3.801 |
| 2286 | 3.801 |
| 2287 | 3.801 |
| 2288 | 3.801 |
| 2289 | 3.801 |
| 2290 | 3.801 |
| 2291 | 3.801 |
| 2292 | 3.801 |
| 2293 | 3.801 |
| 2294 | 3.8 |
| 2295 | 3.801 |
| 2296 | 3.8 |
| 2297 | 3.8 |
| 2298 | 3.8 |
| 2299 | 3.8 |
| 2300 | 3.8 |
| 2301 | 3.8 |
| 2302 | 3.8 |
| 2303 | 3.8 |
| 2304 | 3.8 |
| 2305 | 3.8 |
| 2306 | 3.8 |
| 2307 | 3.799 |
| 2308 | 3.799 |
| 2309 | 3.799 |
| 2310 | 3.798 |
| 2311 | 3.798 |
| 2312 | 3.798 |
| 2313 | 3.798 |
| 2314 | 3.799 |
| 2315 | 3.798 |
| 2316 | 3.799 |
| 2317 | 3.799 |
| 2318 | 3.799 |
| 2319 | 3.798 |
| 2320 | 3.798 |
| 2321 | 3.798 |
| 2322 | 3.798 |
| 2323 | 3.797 |
| 2324 | 3.797 |
| 2325 | 3.797 |
| 2326 | 3.798 |
| 2327 | 3.798 |
| 2328 | 3.797 |
| 2329 | 3.797 |
| 2330 | 3.797 |
| 2331 | 3.798 |
| 2332 | 3.798 |
| 2333 | 3.798 |
| 2334 | 3.797 |
| 2335 | 3.798 |
| 2336 | 3.797 |
| 2337 | 3.798 |
| 2338 | 3.797 |
| 2339 | 3.797 |
| 2340 | 3.797 |
| 2341 | 3.797 |
| 2342 | 3.796 |
| 2343 | 3.796 |
| 2344 | 3.796 |
| 2345 | 3.797 |
| 2346 | 3.797 |
| 2347 | 3.798 |
| 2348 | 3.797 |
| 2349 | 3.797 |
| 2350 | 3.798 |
| 2351 | 3.798 |
| 2352 | 3.797 |
| 2353 | 3.797 |
| 2354 | 3.797 |
| 2355 | 3.798 |
| 2356 | 3.798 |
| 2357 | 3.798 |
| 2358 | 3.798 |
| 2359 | 3.798 |
| 2360 | 3.798 |
| 2361 | 3.798 |
| 2362 | 3.798 |
| 2363 | 3.798 |
| 2364 | 3.798 |
| 2365 | 3.798 |
| 2366 | 3.798 |
| 2367 | 3.799 |
| 2368 | 3.799 |
| 2369 | 3.799 |
| 2370 | 3.798 |
| 2371 | 3.798 |
| 2372 | 3.798 |
| 2373 | 3.797 |
| 2374 | 3.797 |
| 2375 | 3.797 |
| 2376 | 3.798 |
| 2377 | 3.797 |
| 2378 | 3.797 |
| 2379 | 3.798 |
| 2380 | 3.798 |
| 2381 | 3.797 |
| 2382 | 3.797 |
| 2383 | 3.797 |
| 2384 | 3.797 |
| 2385 | 3.797 |
| 2386 | 3.798 |
| 2387 | 3.797 |
| 2388 | 3.797 |
| 2389 | 3.797 |
| 2390 | 3.798 |
| 2391 | 3.797 |
| 2392 | 3.797 |
| 2393 | 3.797 |
| 2394 | 3.797 |
| 2395 | 3.797 |
| 2396 | 3.797 |
| 2397 | 3.797 |
| 2398 | 3.797 |
| 2399 | 3.796 |
| 2400 | 3.796 |
| 2401 | 3.796 |
| 2402 | 3.796 |
| 2403 | 3.796 |
| 2404 | 3.796 |
| 2405 | 3.796 |
| 2406 | 3.796 |
| 2407 | 3.796 |
| 2408 | 3.796 |
| 2409 | 3.796 |
| 2410 | 3.796 |
| 2411 | 3.796 |
| 2412 | 3.797 |
| 2413 | 3.797 |
| 2414 | 3.796 |
| 2415 | 3.796 |
| 2416 | 3.796 |
| 2417 | 3.795 |
| 2418 | 3.795 |
| 2419 | 3.795 |
| 2420 | 3.795 |
| 2421 | 3.795 |
| 2422 | 3.795 |
| 2423 | 3.795 |
| 2424 | 3.795 |
| 2425 | 3.795 |
| 2426 | 3.795 |
| 2427 | 3.795 |
| 2428 | 3.795 |
| 2429 | 3.795 |
| 2430 | 3.795 |
| 2431 | 3.795 |
| 2432 | 3.794 |
| 2433 | 3.794 |
| 2434 | 3.794 |
| 2435 | 3.794 |
| 2436 | 3.794 |
| 2437 | 3.794 |
| 2438 | 3.793 |
| 2439 | 3.794 |
| 2440 | 3.794 |
| 2441 | 3.794 |
| 2442 | 3.794 |
| 2443 | 3.794 |
| 2444 | 3.794 |
| 2445 | 3.795 |
| 2446 | 3.795 |
| 2447 | 3.795 |
| 2448 | 3.795 |
| 2449 | 3.795 |
| 2450 | 3.795 |
| 2451 | 3.795 |
| 2452 | 3.795 |
| 2453 | 3.795 |
| 2454 | 3.796 |
| 2455 | 3.795 |
| 2456 | 3.795 |
| 2457 | 3.795 |
| 2458 | 3.795 |
| 2459 | 3.795 |
| 2460 | 3.795 |
| 2461 | 3.794 |
| 2462 | 3.794 |
| 2463 | 3.794 |
| 2464 | 3.794 |
| 2465 | 3.794 |
| 2466 | 3.793 |
| 2467 | 3.793 |
| 2468 | 3.794 |
| 2469 | 3.794 |
| 2470 | 3.794 |
| 2471 | 3.795 |
| 2472 | 3.795 |
| 2473 | 3.796 |
| 2474 | 3.796 |
| 2475 | 3.796 |
| 2476 | 3.796 |
| 2477 | 3.796 |
| 2478 | 3.796 |
| 2479 | 3.797 |
| 2480 | 3.797 |
| 2481 | 3.798 |
| 2482 | 3.797 |
| 2483 | 3.798 |
| 2484 | 3.798 |
| 2485 | 3.798 |
| 2486 | 3.798 |
| 2487 | 3.798 |
| 2488 | 3.798 |
| 2489 | 3.798 |
| 2490 | 3.798 |
| 2491 | 3.798 |
| 2492 | 3.797 |
| 2493 | 3.798 |
| 2494 | 3.797 |
| 2495 | 3.797 |
| 2496 | 3.797 |
| 2497 | 3.797 |
| 2498 | 3.796 |
| 2499 | 3.797 |
| 2500 | 3.796 |
| 2501 | 3.796 |
| 2502 | 3.796 |
| 2503 | 3.796 |
| 2504 | 3.795 |
| 2505 | 3.796 |
| 2506 | 3.796 |
| 2507 | 3.796 |
| 2508 | 3.796 |
| 2509 | 3.796 |
| 2510 | 3.797 |
| 2511 | 3.797 |
| 2512 | 3.796 |
| 2513 | 3.796 |
| 2514 | 3.796 |
| 2515 | 3.797 |
| 2516 | 3.796 |
| 2517 | 3.796 |
| 2518 | 3.796 |
| 2519 | 3.796 |
| 2520 | 3.796 |
| 2521 | 3.795 |
| 2522 | 3.795 |
| 2523 | 3.796 |
| 2524 | 3.796 |
| 2525 | 3.796 |
| 2526 | 3.796 |
| 2527 | 3.796 |
| 2528 | 3.796 |
| 2529 | 3.796 |
| 2530 | 3.797 |
| 2531 | 3.797 |
| 2532 | 3.796 |
| 2533 | 3.796 |
| 2534 | 3.796 |
| 2535 | 3.795 |
| 2536 | 3.795 |
| 2537 | 3.795 |
| 2538 | 3.795 |
| 2539 | 3.795 |
| 2540 | 3.795 |
| 2541 | 3.795 |
| 2542 | 3.795 |
| 2543 | 3.795 |
| 2544 | 3.795 |
| 2545 | 3.795 |
| 2546 | 3.795 |
| 2547 | 3.795 |
| 2548 | 3.795 |
| 2549 | 3.795 |
| 2550 | 3.794 |
| 2551 | 3.794 |
| 2552 | 3.795 |
| 2553 | 3.794 |
| 2554 | 3.795 |
| 2555 | 3.795 |
| 2556 | 3.795 |
| 2557 | 3.794 |
| 2558 | 3.794 |
| 2559 | 3.794 |
| 2560 | 3.794 |
| 2561 | 3.794 |
| 2562 | 3.794 |
| 2563 | 3.794 |
| 2564 | 3.795 |
| 2565 | 3.795 |
| 2566 | 3.795 |
| 2567 | 3.795 |
| 2568 | 3.795 |
| 2569 | 3.795 |
| 2570 | 3.795 |
| 2571 | 3.795 |
| 2572 | 3.794 |
| 2573 | 3.795 |
| 2574 | 3.795 |
| 2575 | 3.795 |
| 2576 | 3.795 |
| 2577 | 3.795 |
| 2578 | 3.795 |
| 2579 | 3.795 |
| 2580 | 3.795 |
| 2581 | 3.796 |
| 2582 | 3.796 |
| 2583 | 3.796 |
| 2584 | 3.796 |
| 2585 | 3.795 |
| 2586 | 3.795 |
| 2587 | 3.796 |
| 2588 | 3.795 |
| 2589 | 3.795 |
| 2590 | 3.795 |
| 2591 | 3.795 |
| 2592 | 3.795 |
| 2593 | 3.795 |
| 2594 | 3.795 |
| 2595 | 3.795 |
| 2596 | 3.795 |
| 2597 | 3.795 |
| 2598 | 3.795 |
| 2599 | 3.795 |
| 2600 | 3.795 |
| 2601 | 3.795 |
| 2602 | 3.794 |
| 2603 | 3.795 |
| 2604 | 3.795 |
| 2605 | 3.794 |
| 2606 | 3.794 |
| 2607 | 3.794 |
| 2608 | 3.794 |
| 2609 | 3.794 |
| 2610 | 3.794 |
| 2611 | 3.794 |
| 2612 | 3.795 |
| 2613 | 3.795 |
| 2614 | 3.795 |
| 2615 | 3.795 |
| 2616 | 3.796 |
| 2617 | 3.795 |
| 2618 | 3.795 |
| 2619 | 3.795 |
| 2620 | 3.795 |
| 2621 | 3.795 |
| 2622 | 3.796 |
| 2623 | 3.796 |
| 2624 | 3.796 |
| 2625 | 3.796 |
| 2626 | 3.796 |
| 2627 | 3.796 |
| 2628 | 3.796 |
| 2629 | 3.795 |
| 2630 | 3.795 |
| 2631 | 3.795 |
| 2632 | 3.795 |
| 2633 | 3.795 |
| 2634 | 3.794 |
| 2635 | 3.795 |
| 2636 | 3.794 |
| 2637 | 3.795 |
| 2638 | 3.795 |
| 2639 | 3.795 |
| 2640 | 3.796 |
| 2641 | 3.796 |
| 2642 | 3.796 |
| 2643 | 3.796 |
| 2644 | 3.795 |
| 2645 | 3.796 |
| 2646 | 3.795 |
| 2647 | 3.795 |
| 2648 | 3.795 |
| 2649 | 3.795 |
| 2650 | 3.795 |
| 2651 | 3.795 |
| 2652 | 3.795 |
| 2653 | 3.795 |
| 2654 | 3.795 |
| 2655 | 3.795 |
| 2656 | 3.795 |
| 2657 | 3.795 |
| 2658 | 3.795 |
| 2659 | 3.795 |
| 2660 | 3.794 |
| 2661 | 3.794 |
| 2662 | 3.795 |
| 2663 | 3.795 |
| 2664 | 3.795 |
| 2665 | 3.795 |
| 2666 | 3.795 |
| 2667 | 3.795 |
| 2668 | 3.795 |
| 2669 | 3.795 |
| 2670 | 3.795 |
| 2671 | 3.795 |
| 2672 | 3.795 |
| 2673 | 3.794 |
| 2674 | 3.795 |
| 2675 | 3.795 |
| 2676 | 3.795 |
| 2677 | 3.795 |
| 2678 | 3.795 |
| 2679 | 3.795 |
| 2680 | 3.796 |
| 2681 | 3.796 |
| 2682 | 3.796 |
| 2683 | 3.797 |
| 2684 | 3.796 |
| 2685 | 3.796 |
| 2686 | 3.796 |
| 2687 | 3.796 |
| 2688 | 3.796 |
| 2689 | 3.797 |
| 2690 | 3.796 |
| 2691 | 3.796 |
| 2692 | 3.796 |
| 2693 | 3.796 |
| 2694 | 3.796 |
| 2695 | 3.796 |
| 2696 | 3.795 |
| 2697 | 3.796 |
| 2698 | 3.795 |
| 2699 | 3.796 |
| 2700 | 3.796 |
| 2701 | 3.796 |
| 2702 | 3.795 |
| 2703 | 3.795 |
| 2704 | 3.795 |
| 2705 | 3.795 |
| 2706 | 3.795 |
| 2707 | 3.795 |
| 2708 | 3.795 |
| 2709 | 3.795 |
| 2710 | 3.795 |
| 2711 | 3.795 |
| 2712 | 3.795 |
| 2713 | 3.795 |
| 2714 | 3.795 |
| 2715 | 3.795 |
| 2716 | 3.794 |
| 2717 | 3.794 |
| 2718 | 3.794 |
| 2719 | 3.794 |
| 2720 | 3.795 |
| 2721 | 3.795 |
| 2722 | 3.795 |
| 2723 | 3.795 |
| 2724 | 3.795 |
| 2725 | 3.795 |
| 2726 | 3.795 |
| 2727 | 3.795 |
| 2728 | 3.796 |
| 2729 | 3.795 |
| 2730 | 3.795 |
| 2731 | 3.795 |
| 2732 | 3.795 |
| 2733 | 3.795 |
| 2734 | 3.795 |
| 2735 | 3.795 |
| 2736 | 3.795 |
| 2737 | 3.794 |
| 2738 | 3.794 |
| 2739 | 3.795 |
| 2740 | 3.795 |
| 2741 | 3.795 |
| 2742 | 3.794 |
| 2743 | 3.794 |
| 2744 | 3.794 |
| 2745 | 3.794 |
| 2746 | 3.794 |
| 2747 | 3.794 |
| 2748 | 3.794 |
| 2749 | 3.793 |
| 2750 | 3.793 |
| 2751 | 3.794 |
| 2752 | 3.794 |
| 2753 | 3.794 |
| 2754 | 3.794 |
| 2755 | 3.794 |
| 2756 | 3.794 |
| 2757 | 3.794 |
| 2758 | 3.794 |
| 2759 | 3.794 |
| 2760 | 3.794 |
| 2761 | 3.794 |
| 2762 | 3.794 |
| 2763 | 3.794 |
| 2764 | 3.794 |
| 2765 | 3.794 |
| 2766 | 3.794 |
| 2767 | 3.795 |
| 2768 | 3.795 |
| 2769 | 3.794 |
| 2770 | 3.794 |
| 2771 | 3.794 |
| 2772 | 3.794 |
| 2773 | 3.794 |
| 2774 | 3.794 |
| 2775 | 3.794 |
| 2776 | 3.794 |
| 2777 | 3.794 |
| 2778 | 3.794 |
| 2779 | 3.794 |
| 2780 | 3.794 |
| 2781 | 3.794 |
| 2782 | 3.794 |
| 2783 | 3.794 |
| 2784 | 3.794 |
| 2785 | 3.794 |
| 2786 | 3.794 |
| 2787 | 3.794 |
| 2788 | 3.794 |
| 2789 | 3.795 |
| 2790 | 3.795 |
| 2791 | 3.795 |
| 2792 | 3.795 |
| 2793 | 3.795 |
| 2794 | 3.795 |
| 2795 | 3.795 |
| 2796 | 3.795 |
| 2797 | 3.795 |
| 2798 | 3.795 |
| 2799 | 3.795 |
| 2800 | 3.795 |
| 2801 | 3.794 |
| 2802 | 3.795 |
| 2803 | 3.794 |
| 2804 | 3.794 |
| 2805 | 3.794 |
| 2806 | 3.795 |
| 2807 | 3.795 |
| 2808 | 3.795 |
| 2809 | 3.795 |
| 2810 | 3.795 |
| 2811 | 3.795 |
| 2812 | 3.795 |
| 2813 | 3.795 |
| 2814 | 3.794 |
| 2815 | 3.794 |
| 2816 | 3.794 |
| 2817 | 3.795 |
| 2818 | 3.795 |
| 2819 | 3.794 |
| 2820 | 3.794 |
| 2821 | 3.795 |
| 2822 | 3.795 |
| 2823 | 3.795 |
| 2824 | 3.795 |
| 2825 | 3.795 |
| 2826 | 3.795 |
| 2827 | 3.795 |
| 2828 | 3.795 |
| 2829 | 3.796 |
| 2830 | 3.796 |
| 2831 | 3.796 |
| 2832 | 3.796 |
| 2833 | 3.796 |
| 2834 | 3.796 |
| 2835 | 3.796 |
| 2836 | 3.796 |
| 2837 | 3.796 |
| 2838 | 3.796 |
| 2839 | 3.796 |
| 2840 | 3.796 |
| 2841 | 3.796 |
| 2842 | 3.797 |
| 2843 | 3.796 |
| 2844 | 3.796 |
| 2845 | 3.797 |
| 2846 | 3.797 |
| 2847 | 3.797 |
| 2848 | 3.798 |
| 2849 | 3.798 |
| 2850 | 3.798 |
| 2851 | 3.797 |
| 2852 | 3.798 |
| 2853 | 3.797 |
| 2854 | 3.797 |
| 2855 | 3.797 |
| 2856 | 3.797 |
| 2857 | 3.797 |
| 2858 | 3.797 |
| 2859 | 3.797 |
| 2860 | 3.797 |
| 2861 | 3.797 |
| 2862 | 3.797 |
| 2863 | 3.798 |
| 2864 | 3.798 |
| 2865 | 3.798 |
| 2866 | 3.798 |
| 2867 | 3.797 |
| 2868 | 3.797 |
| 2869 | 3.798 |
| 2870 | 3.798 |
| 2871 | 3.798 |
| 2872 | 3.797 |
| 2873 | 3.797 |
| 2874 | 3.798 |
| 2875 | 3.798 |
| 2876 | 3.798 |
| 2877 | 3.798 |
| 2878 | 3.798 |
| 2879 | 3.798 |
| 2880 | 3.797 |
| 2881 | 3.797 |
| 2882 | 3.797 |
| 2883 | 3.797 |
| 2884 | 3.797 |
| 2885 | 3.797 |
| 2886 | 3.797 |
| 2887 | 3.796 |
| 2888 | 3.796 |
| 2889 | 3.796 |
| 2890 | 3.796 |
| 2891 | 3.796 |
| 2892 | 3.796 |
| 2893 | 3.796 |
| 2894 | 3.797 |
| 2895 | 3.797 |
| 2896 | 3.797 |
| 2897 | 3.796 |
| 2898 | 3.796 |
| 2899 | 3.796 |
| 2900 | 3.796 |
| 2901 | 3.796 |
| 2902 | 3.796 |
| 2903 | 3.796 |
| 2904 | 3.796 |
| 2905 | 3.796 |
| 2906 | 3.796 |
| 2907 | 3.795 |
| 2908 | 3.796 |
| 2909 | 3.796 |
| 2910 | 3.796 |
| 2911 | 3.796 |
| 2912 | 3.796 |
| 2913 | 3.796 |
| 2914 | 3.796 |
| 2915 | 3.796 |
| 2916 | 3.796 |
| 2917 | 3.796 |
| 2918 | 3.795 |
| 2919 | 3.795 |
| 2920 | 3.796 |
| 2921 | 3.795 |
| 2922 | 3.795 |
| 2923 | 3.795 |
| 2924 | 3.795 |
| 2925 | 3.795 |
| 2926 | 3.795 |
| 2927 | 3.795 |
| 2928 | 3.795 |
| 2929 | 3.795 |
| 2930 | 3.796 |
| 2931 | 3.796 |
| 2932 | 3.796 |
| 2933 | 3.796 |
| 2934 | 3.796 |
| 2935 | 3.795 |
| 2936 | 3.795 |
| 2937 | 3.795 |
| 2938 | 3.795 |
| 2939 | 3.795 |
| 2940 | 3.795 |
| 2941 | 3.795 |
| 2942 | 3.795 |
| 2943 | 3.795 |
| 2944 | 3.795 |
| 2945 | 3.794 |
| 2946 | 3.794 |
| 2947 | 3.794 |
| 2948 | 3.794 |
| 2949 | 3.794 |
| 2950 | 3.794 |
| 2951 | 3.794 |
| 2952 | 3.794 |
| 2953 | 3.794 |
| 2954 | 3.794 |
| 2955 | 3.794 |
| 2956 | 3.794 |
| 2957 | 3.794 |
| 2958 | 3.794 |
| 2959 | 3.793 |
| 2960 | 3.793 |
| 2961 | 3.793 |
| 2962 | 3.793 |
| 2963 | 3.793 |
| 2964 | 3.793 |
| 2965 | 3.793 |
| 2966 | 3.793 |
| 2967 | 3.793 |
| 2968 | 3.794 |
| 2969 | 3.794 |
| 2970 | 3.794 |
| 2971 | 3.793 |
| 2972 | 3.793 |
| 2973 | 3.793 |
| 2974 | 3.793 |
| 2975 | 3.794 |
| 2976 | 3.793 |
| 2977 | 3.793 |
| 2978 | 3.793 |
| 2979 | 3.793 |
| 2980 | 3.794 |
| 2981 | 3.793 |
| 2982 | 3.793 |
| 2983 | 3.794 |
| 2984 | 3.794 |
| 2985 | 3.794 |
| 2986 | 3.794 |
| 2987 | 3.794 |
| 2988 | 3.794 |
| 2989 | 3.793 |
| 2990 | 3.793 |
| 2991 | 3.793 |
| 2992 | 3.793 |
| 2993 | 3.793 |
| 2994 | 3.793 |
| 2995 | 3.793 |
| 2996 | 3.793 |
| 2997 | 3.793 |
| 2998 | 3.793 |
| 2999 | 3.793 |
| 3000 | 3.793 |
| 3001 | 3.793 |
| 3002 | 3.793 |
| 3003 | 3.793 |
| 3004 | 3.793 |
| 3005 | 3.793 |
| 3006 | 3.792 |
| 3007 | 3.792 |
| 3008 | 3.792 |
| 3009 | 3.792 |
| 3010 | 3.792 |
| 3011 | 3.792 |
| 3012 | 3.792 |
| 3013 | 3.792 |
| 3014 | 3.792 |
| 3015 | 3.791 |
| 3016 | 3.791 |
| 3017 | 3.791 |
| 3018 | 3.791 |
| 3019 | 3.792 |
| 3020 | 3.792 |
| 3021 | 3.792 |
| 3022 | 3.792 |
| 3023 | 3.792 |
| 3024 | 3.792 |
| 3025 | 3.792 |
| 3026 | 3.792 |
| 3027 | 3.792 |
| 3028 | 3.792 |
| 3029 | 3.792 |
| 3030 | 3.792 |
| 3031 | 3.792 |
| 3032 | 3.792 |
| 3033 | 3.793 |
| 3034 | 3.792 |
| 3035 | 3.792 |
| 3036 | 3.792 |
| 3037 | 3.792 |
| 3038 | 3.792 |
| 3039 | 3.792 |
| 3040 | 3.793 |
| 3041 | 3.793 |
| 3042 | 3.793 |
| 3043 | 3.793 |
| 3044 | 3.793 |
| 3045 | 3.793 |
| 3046 | 3.794 |
| 3047 | 3.793 |
| 3048 | 3.794 |
| 3049 | 3.794 |
| 3050 | 3.794 |
| 3051 | 3.794 |
| 3052 | 3.794 |
| 3053 | 3.794 |
| 3054 | 3.794 |
| 3055 | 3.794 |
| 3056 | 3.793 |
| 3057 | 3.793 |
| 3058 | 3.793 |
| 3059 | 3.793 |
| 3060 | 3.793 |
| 3061 | 3.793 |
| 3062 | 3.793 |
| 3063 | 3.793 |
| 3064 | 3.793 |
| 3065 | 3.793 |
| 3066 | 3.793 |
| 3067 | 3.793 |
| 3068 | 3.793 |
| 3069 | 3.793 |
| 3070 | 3.793 |
| 3071 | 3.792 |
| 3072 | 3.792 |
| 3073 | 3.792 |
| 3074 | 3.792 |
| 3075 | 3.793 |
| 3076 | 3.793 |
| 3077 | 3.793 |
| 3078 | 3.793 |
| 3079 | 3.793 |
| 3080 | 3.793 |
| 3081 | 3.793 |
| 3082 | 3.793 |
| 3083 | 3.793 |
| 3084 | 3.793 |
| 3085 | 3.793 |
| 3086 | 3.792 |
| 3087 | 3.792 |
| 3088 | 3.792 |
| 3089 | 3.792 |
| 3090 | 3.792 |
| 3091 | 3.792 |
| 3092 | 3.792 |
| 3093 | 3.793 |
| 3094 | 3.793 |
| 3095 | 3.793 |
| 3096 | 3.793 |
| 3097 | 3.793 |
| 3098 | 3.793 |
| 3099 | 3.793 |
| 3100 | 3.793 |
| 3101 | 3.793 |
| 3102 | 3.793 |
| 3103 | 3.793 |
| 3104 | 3.793 |
| 3105 | 3.793 |
| 3106 | 3.793 |
| 3107 | 3.793 |
| 3108 | 3.793 |
| 3109 | 3.793 |
| 3110 | 3.794 |
| 3111 | 3.794 |
| 3112 | 3.793 |
| 3113 | 3.794 |
| 3114 | 3.794 |
| 3115 | 3.794 |
| 3116 | 3.794 |
| 3117 | 3.794 |
| 3118 | 3.794 |
| 3119 | 3.794 |
| 3120 | 3.794 |
| 3121 | 3.794 |
| 3122 | 3.794 |
| 3123 | 3.794 |
| 3124 | 3.794 |
| 3125 | 3.793 |
| 3126 | 3.793 |
| 3127 | 3.794 |
| 3128 | 3.794 |
| 3129 | 3.794 |
| 3130 | 3.794 |
| 3131 | 3.794 |
| 3132 | 3.794 |
| 3133 | 3.795 |
| 3134 | 3.795 |
| 3135 | 3.795 |
| 3136 | 3.795 |
| 3137 | 3.795 |
| 3138 | 3.795 |
| 3139 | 3.796 |
| 3140 | 3.795 |
| 3141 | 3.795 |
| 3142 | 3.796 |
| 3143 | 3.796 |
| 3144 | 3.796 |
| 3145 | 3.795 |
| 3146 | 3.795 |
| 3147 | 3.795 |
| 3148 | 3.795 |
| 3149 | 3.795 |
| 3150 | 3.795 |
| 3151 | 3.794 |
| 3152 | 3.795 |
| 3153 | 3.795 |
| 3154 | 3.794 |
| 3155 | 3.794 |
| 3156 | 3.795 |
| 3157 | 3.795 |
| 3158 | 3.795 |
| 3159 | 3.795 |
| 3160 | 3.795 |
| 3161 | 3.794 |
| 3162 | 3.794 |
| 3163 | 3.794 |
| 3164 | 3.794 |
| 3165 | 3.794 |
| 3166 | 3.794 |
| 3167 | 3.795 |
| 3168 | 3.795 |
| 3169 | 3.795 |
| 3170 | 3.795 |
| 3171 | 3.795 |
| 3172 | 3.795 |
| 3173 | 3.795 |
| 3174 | 3.796 |
| 3175 | 3.796 |
| 3176 | 3.796 |
| 3177 | 3.796 |
| 3178 | 3.796 |
| 3179 | 3.796 |
| 3180 | 3.796 |
| 3181 | 3.796 |
| 3182 | 3.796 |
| 3183 | 3.796 |
| 3184 | 3.796 |
| 3185 | 3.796 |
| 3186 | 3.796 |
| 3187 | 3.796 |
| 3188 | 3.796 |
| 3189 | 3.796 |
| 3190 | 3.796 |
| 3191 | 3.796 |
| 3192 | 3.796 |
| 3193 | 3.796 |
| 3194 | 3.795 |
| 3195 | 3.795 |
| 3196 | 3.795 |
| 3197 | 3.795 |
| 3198 | 3.795 |
| 3199 | 3.794 |
| 3200 | 3.794 |
| 3201 | 3.795 |
| 3202 | 3.795 |
| 3203 | 3.795 |
| 3204 | 3.794 |
| 3205 | 3.794 |
| 3206 | 3.794 |
| 3207 | 3.794 |
| 3208 | 3.795 |
| 3209 | 3.794 |
| 3210 | 3.794 |
| 3211 | 3.794 |
| 3212 | 3.794 |
| 3213 | 3.794 |
| 3214 | 3.794 |
| 3215 | 3.794 |
| 3216 | 3.794 |
| 3217 | 3.794 |
| 3218 | 3.794 |
| 3219 | 3.794 |
| 3220 | 3.794 |
| 3221 | 3.794 |
| 3222 | 3.794 |
| 3223 | 3.794 |
| 3224 | 3.794 |
| 3225 | 3.794 |
| 3226 | 3.794 |
| 3227 | 3.794 |
| 3228 | 3.794 |
| 3229 | 3.794 |
| 3230 | 3.794 |
| 3231 | 3.794 |
| 3232 | 3.794 |
| 3233 | 3.794 |
| 3234 | 3.794 |
| 3235 | 3.794 |
| 3236 | 3.794 |
| 3237 | 3.794 |
| 3238 | 3.795 |
| 3239 | 3.795 |
| 3240 | 3.795 |
| 3241 | 3.795 |
| 3242 | 3.795 |
| 3243 | 3.795 |
| 3244 | 3.795 |
| 3245 | 3.795 |
| 3246 | 3.795 |
| 3247 | 3.795 |
| 3248 | 3.795 |
| 3249 | 3.795 |
| 3250 | 3.795 |
| 3251 | 3.794 |
| 3252 | 3.794 |
| 3253 | 3.794 |
| 3254 | 3.794 |
| 3255 | 3.794 |
| 3256 | 3.793 |
| 3257 | 3.793 |
| 3258 | 3.793 |
| 3259 | 3.793 |
| 3260 | 3.793 |
| 3261 | 3.793 |
| 3262 | 3.793 |
| 3263 | 3.793 |
| 3264 | 3.793 |
| 3265 | 3.793 |
| 3266 | 3.793 |
| 3267 | 3.793 |
| 3268 | 3.793 |
| 3269 | 3.793 |
| 3270 | 3.793 |
| 3271 | 3.792 |
| 3272 | 3.793 |
| 3273 | 3.793 |
| 3274 | 3.793 |
| 3275 | 3.793 |
| 3276 | 3.793 |
| 3277 | 3.793 |
| 3278 | 3.793 |
| 3279 | 3.792 |
| 3280 | 3.792 |
| 3281 | 3.792 |
| 3282 | 3.792 |
| 3283 | 3.792 |
| 3284 | 3.792 |
| 3285 | 3.792 |
| 3286 | 3.792 |
| 3287 | 3.792 |
| 3288 | 3.792 |
| 3289 | 3.792 |
| 3290 | 3.792 |
| 3291 | 3.793 |
| 3292 | 3.793 |
| 3293 | 3.792 |
| 3294 | 3.792 |
| 3295 | 3.792 |
| 3296 | 3.792 |
| 3297 | 3.793 |
| 3298 | 3.792 |
| 3299 | 3.792 |
| 3300 | 3.793 |
| 3301 | 3.793 |
| 3302 | 3.793 |
| 3303 | 3.793 |
| 3304 | 3.792 |
| 3305 | 3.792 |
| 3306 | 3.793 |
| 3307 | 3.792 |
| 3308 | 3.792 |
| 3309 | 3.792 |
| 3310 | 3.792 |
| 3311 | 3.792 |
| 3312 | 3.792 |
| 3313 | 3.792 |
| 3314 | 3.792 |
| 3315 | 3.792 |
| 3316 | 3.792 |
| 3317 | 3.792 |
| 3318 | 3.792 |
| 3319 | 3.792 |
| 3320 | 3.792 |
| 3321 | 3.793 |
| 3322 | 3.793 |
| 3323 | 3.793 |
| 3324 | 3.793 |
| 3325 | 3.793 |
| 3326 | 3.793 |